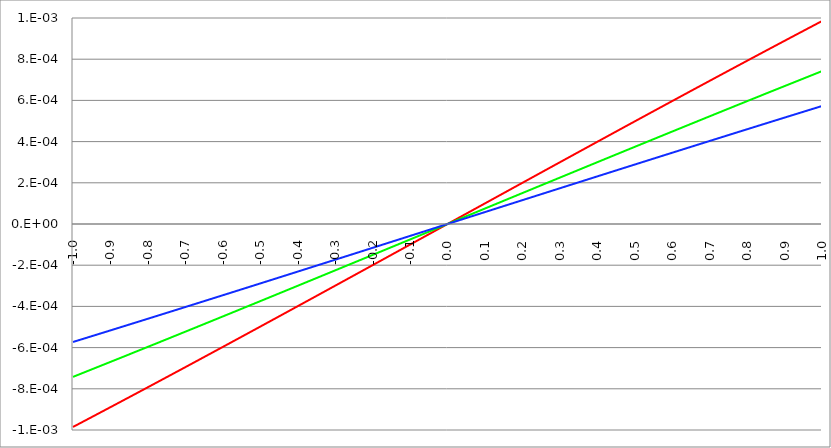
| Category | Series 1 | Series 0 | Series 2 |
|---|---|---|---|
| -1.0 | -0.001 | -0.001 | -0.001 |
| -0.999 | -0.001 | -0.001 | -0.001 |
| -0.998 | -0.001 | -0.001 | -0.001 |
| -0.997 | -0.001 | -0.001 | -0.001 |
| -0.996 | -0.001 | -0.001 | -0.001 |
| -0.995 | -0.001 | -0.001 | -0.001 |
| -0.994 | -0.001 | -0.001 | -0.001 |
| -0.993 | -0.001 | -0.001 | -0.001 |
| -0.992 | -0.001 | -0.001 | -0.001 |
| -0.991 | -0.001 | -0.001 | -0.001 |
| -0.99 | -0.001 | -0.001 | -0.001 |
| -0.989 | -0.001 | -0.001 | -0.001 |
| -0.988 | -0.001 | -0.001 | -0.001 |
| -0.987 | -0.001 | -0.001 | -0.001 |
| -0.986 | -0.001 | -0.001 | -0.001 |
| -0.985 | -0.001 | -0.001 | -0.001 |
| -0.984 | -0.001 | -0.001 | -0.001 |
| -0.983 | -0.001 | -0.001 | -0.001 |
| -0.982 | -0.001 | -0.001 | -0.001 |
| -0.981 | -0.001 | -0.001 | -0.001 |
| -0.98 | -0.001 | -0.001 | -0.001 |
| -0.979 | -0.001 | -0.001 | -0.001 |
| -0.978 | -0.001 | -0.001 | -0.001 |
| -0.977 | -0.001 | -0.001 | -0.001 |
| -0.976 | -0.001 | -0.001 | -0.001 |
| -0.975 | -0.001 | -0.001 | -0.001 |
| -0.974 | -0.001 | -0.001 | -0.001 |
| -0.973 | -0.001 | -0.001 | -0.001 |
| -0.972 | -0.001 | -0.001 | -0.001 |
| -0.971 | -0.001 | -0.001 | -0.001 |
| -0.97 | -0.001 | -0.001 | -0.001 |
| -0.969 | -0.001 | -0.001 | -0.001 |
| -0.968 | -0.001 | -0.001 | -0.001 |
| -0.967 | -0.001 | -0.001 | -0.001 |
| -0.966 | -0.001 | -0.001 | -0.001 |
| -0.965 | -0.001 | -0.001 | -0.001 |
| -0.964 | -0.001 | -0.001 | -0.001 |
| -0.963 | -0.001 | -0.001 | -0.001 |
| -0.962 | -0.001 | -0.001 | -0.001 |
| -0.961 | -0.001 | -0.001 | -0.001 |
| -0.96 | -0.001 | -0.001 | -0.001 |
| -0.959 | -0.001 | -0.001 | -0.001 |
| -0.958 | -0.001 | -0.001 | -0.001 |
| -0.957 | -0.001 | -0.001 | -0.001 |
| -0.956 | -0.001 | -0.001 | -0.001 |
| -0.955 | -0.001 | -0.001 | -0.001 |
| -0.954 | -0.001 | -0.001 | -0.001 |
| -0.953 | -0.001 | -0.001 | -0.001 |
| -0.952 | -0.001 | -0.001 | -0.001 |
| -0.951 | -0.001 | -0.001 | -0.001 |
| -0.95 | -0.001 | -0.001 | -0.001 |
| -0.949 | -0.001 | -0.001 | -0.001 |
| -0.948 | -0.001 | -0.001 | -0.001 |
| -0.947 | -0.001 | -0.001 | -0.001 |
| -0.946 | -0.001 | -0.001 | -0.001 |
| -0.945 | -0.001 | -0.001 | -0.001 |
| -0.944 | -0.001 | -0.001 | -0.001 |
| -0.943 | -0.001 | -0.001 | -0.001 |
| -0.942 | -0.001 | -0.001 | -0.001 |
| -0.941 | -0.001 | -0.001 | -0.001 |
| -0.94 | -0.001 | -0.001 | -0.001 |
| -0.939 | -0.001 | -0.001 | -0.001 |
| -0.938 | -0.001 | -0.001 | -0.001 |
| -0.937 | -0.001 | -0.001 | -0.001 |
| -0.936 | -0.001 | -0.001 | -0.001 |
| -0.935 | -0.001 | -0.001 | -0.001 |
| -0.934 | -0.001 | -0.001 | -0.001 |
| -0.933 | -0.001 | -0.001 | -0.001 |
| -0.932 | -0.001 | -0.001 | -0.001 |
| -0.931 | -0.001 | -0.001 | -0.001 |
| -0.93 | -0.001 | -0.001 | -0.001 |
| -0.929 | -0.001 | -0.001 | -0.001 |
| -0.928 | -0.001 | -0.001 | -0.001 |
| -0.927 | -0.001 | -0.001 | -0.001 |
| -0.926 | -0.001 | -0.001 | -0.001 |
| -0.925 | -0.001 | -0.001 | -0.001 |
| -0.924 | -0.001 | -0.001 | -0.001 |
| -0.923 | -0.001 | -0.001 | -0.001 |
| -0.922 | -0.001 | -0.001 | -0.001 |
| -0.921 | -0.001 | -0.001 | -0.001 |
| -0.92 | -0.001 | -0.001 | -0.001 |
| -0.919 | -0.001 | -0.001 | -0.001 |
| -0.918 | -0.001 | -0.001 | -0.001 |
| -0.917 | -0.001 | -0.001 | -0.001 |
| -0.916 | -0.001 | -0.001 | -0.001 |
| -0.915 | -0.001 | -0.001 | -0.001 |
| -0.914 | -0.001 | -0.001 | -0.001 |
| -0.913 | -0.001 | -0.001 | -0.001 |
| -0.912 | -0.001 | -0.001 | -0.001 |
| -0.911 | -0.001 | -0.001 | -0.001 |
| -0.91 | -0.001 | -0.001 | -0.001 |
| -0.909 | -0.001 | -0.001 | -0.001 |
| -0.908 | -0.001 | -0.001 | -0.001 |
| -0.907 | -0.001 | -0.001 | -0.001 |
| -0.906 | -0.001 | -0.001 | -0.001 |
| -0.905 | -0.001 | -0.001 | -0.001 |
| -0.904 | -0.001 | -0.001 | -0.001 |
| -0.903 | -0.001 | -0.001 | -0.001 |
| -0.902 | -0.001 | -0.001 | -0.001 |
| -0.901 | -0.001 | -0.001 | -0.001 |
| -0.9 | -0.001 | -0.001 | -0.001 |
| -0.899 | -0.001 | -0.001 | -0.001 |
| -0.898 | -0.001 | -0.001 | -0.001 |
| -0.897 | -0.001 | -0.001 | -0.001 |
| -0.896 | -0.001 | -0.001 | -0.001 |
| -0.895 | -0.001 | -0.001 | -0.001 |
| -0.894 | -0.001 | -0.001 | -0.001 |
| -0.893 | -0.001 | -0.001 | -0.001 |
| -0.892 | -0.001 | -0.001 | -0.001 |
| -0.891 | -0.001 | -0.001 | -0.001 |
| -0.89 | -0.001 | -0.001 | -0.001 |
| -0.889 | -0.001 | -0.001 | -0.001 |
| -0.888 | -0.001 | -0.001 | -0.001 |
| -0.887 | -0.001 | -0.001 | -0.001 |
| -0.886 | -0.001 | -0.001 | -0.001 |
| -0.885 | -0.001 | -0.001 | -0.001 |
| -0.884 | -0.001 | -0.001 | -0.001 |
| -0.883 | -0.001 | -0.001 | -0.001 |
| -0.882 | -0.001 | -0.001 | -0.001 |
| -0.881 | -0.001 | -0.001 | -0.001 |
| -0.88 | -0.001 | -0.001 | -0.001 |
| -0.879 | -0.001 | -0.001 | -0.001 |
| -0.878 | -0.001 | -0.001 | -0.001 |
| -0.877 | -0.001 | -0.001 | -0.001 |
| -0.876 | -0.001 | -0.001 | -0.001 |
| -0.875 | -0.001 | -0.001 | -0.001 |
| -0.874 | -0.001 | -0.001 | -0.001 |
| -0.873 | -0.001 | -0.001 | -0.001 |
| -0.872 | -0.001 | -0.001 | -0.001 |
| -0.871 | -0.001 | -0.001 | -0.001 |
| -0.87 | -0.001 | -0.001 | 0 |
| -0.869 | -0.001 | -0.001 | 0 |
| -0.868 | -0.001 | -0.001 | 0 |
| -0.867 | -0.001 | -0.001 | 0 |
| -0.866 | -0.001 | -0.001 | 0 |
| -0.865 | -0.001 | -0.001 | 0 |
| -0.864 | -0.001 | -0.001 | 0 |
| -0.863 | -0.001 | -0.001 | 0 |
| -0.862 | -0.001 | -0.001 | 0 |
| -0.861 | -0.001 | -0.001 | 0 |
| -0.86 | -0.001 | -0.001 | 0 |
| -0.859 | -0.001 | -0.001 | 0 |
| -0.858 | -0.001 | -0.001 | 0 |
| -0.857 | -0.001 | -0.001 | 0 |
| -0.856 | -0.001 | -0.001 | 0 |
| -0.855 | -0.001 | -0.001 | 0 |
| -0.854 | -0.001 | -0.001 | 0 |
| -0.853 | -0.001 | -0.001 | 0 |
| -0.852 | -0.001 | -0.001 | 0 |
| -0.851 | -0.001 | -0.001 | 0 |
| -0.85 | -0.001 | -0.001 | 0 |
| -0.849 | -0.001 | -0.001 | 0 |
| -0.848 | -0.001 | -0.001 | 0 |
| -0.847 | -0.001 | -0.001 | 0 |
| -0.846 | -0.001 | -0.001 | 0 |
| -0.845 | -0.001 | -0.001 | 0 |
| -0.844 | -0.001 | -0.001 | 0 |
| -0.843 | -0.001 | -0.001 | 0 |
| -0.842 | -0.001 | -0.001 | 0 |
| -0.841 | -0.001 | -0.001 | 0 |
| -0.84 | -0.001 | -0.001 | 0 |
| -0.839 | -0.001 | -0.001 | 0 |
| -0.838 | -0.001 | -0.001 | 0 |
| -0.837 | -0.001 | -0.001 | 0 |
| -0.836 | -0.001 | -0.001 | 0 |
| -0.835 | -0.001 | -0.001 | 0 |
| -0.834 | -0.001 | -0.001 | 0 |
| -0.833 | -0.001 | -0.001 | 0 |
| -0.832 | -0.001 | -0.001 | 0 |
| -0.831 | -0.001 | -0.001 | 0 |
| -0.83 | -0.001 | -0.001 | 0 |
| -0.829 | -0.001 | -0.001 | 0 |
| -0.828 | -0.001 | -0.001 | 0 |
| -0.827 | -0.001 | -0.001 | 0 |
| -0.826 | -0.001 | -0.001 | 0 |
| -0.825 | -0.001 | -0.001 | 0 |
| -0.824 | -0.001 | -0.001 | 0 |
| -0.823 | -0.001 | -0.001 | 0 |
| -0.822 | -0.001 | -0.001 | 0 |
| -0.821 | -0.001 | -0.001 | 0 |
| -0.82 | -0.001 | -0.001 | 0 |
| -0.819 | -0.001 | -0.001 | 0 |
| -0.818 | -0.001 | -0.001 | 0 |
| -0.817 | -0.001 | -0.001 | 0 |
| -0.816 | -0.001 | -0.001 | 0 |
| -0.815 | -0.001 | -0.001 | 0 |
| -0.814 | -0.001 | -0.001 | 0 |
| -0.813 | -0.001 | -0.001 | 0 |
| -0.812 | -0.001 | -0.001 | 0 |
| -0.811 | -0.001 | -0.001 | 0 |
| -0.81 | -0.001 | -0.001 | 0 |
| -0.809 | -0.001 | -0.001 | 0 |
| -0.808 | -0.001 | -0.001 | 0 |
| -0.807 | -0.001 | -0.001 | 0 |
| -0.806 | -0.001 | -0.001 | 0 |
| -0.805 | -0.001 | -0.001 | 0 |
| -0.804 | -0.001 | -0.001 | 0 |
| -0.803 | -0.001 | -0.001 | 0 |
| -0.802 | -0.001 | -0.001 | 0 |
| -0.801 | -0.001 | -0.001 | 0 |
| -0.8 | -0.001 | -0.001 | 0 |
| -0.799 | -0.001 | -0.001 | 0 |
| -0.798 | -0.001 | -0.001 | 0 |
| -0.797 | -0.001 | -0.001 | 0 |
| -0.796 | -0.001 | -0.001 | 0 |
| -0.795 | -0.001 | -0.001 | 0 |
| -0.794 | -0.001 | -0.001 | 0 |
| -0.793 | -0.001 | -0.001 | 0 |
| -0.792 | -0.001 | -0.001 | 0 |
| -0.791 | -0.001 | -0.001 | 0 |
| -0.79 | -0.001 | -0.001 | 0 |
| -0.789 | -0.001 | -0.001 | 0 |
| -0.788 | -0.001 | -0.001 | 0 |
| -0.787 | -0.001 | -0.001 | 0 |
| -0.786 | -0.001 | -0.001 | 0 |
| -0.785 | -0.001 | -0.001 | 0 |
| -0.784 | -0.001 | -0.001 | 0 |
| -0.783 | -0.001 | -0.001 | 0 |
| -0.782 | -0.001 | -0.001 | 0 |
| -0.781 | -0.001 | -0.001 | 0 |
| -0.78 | -0.001 | -0.001 | 0 |
| -0.779 | -0.001 | -0.001 | 0 |
| -0.778 | -0.001 | -0.001 | 0 |
| -0.777 | -0.001 | -0.001 | 0 |
| -0.776 | -0.001 | -0.001 | 0 |
| -0.775 | -0.001 | -0.001 | 0 |
| -0.774 | -0.001 | -0.001 | 0 |
| -0.773 | -0.001 | -0.001 | 0 |
| -0.772 | -0.001 | -0.001 | 0 |
| -0.771 | -0.001 | -0.001 | 0 |
| -0.77 | -0.001 | -0.001 | 0 |
| -0.769 | -0.001 | -0.001 | 0 |
| -0.768 | -0.001 | -0.001 | 0 |
| -0.767 | -0.001 | -0.001 | 0 |
| -0.766 | -0.001 | -0.001 | 0 |
| -0.765 | -0.001 | -0.001 | 0 |
| -0.764 | -0.001 | -0.001 | 0 |
| -0.763 | -0.001 | -0.001 | 0 |
| -0.762 | -0.001 | -0.001 | 0 |
| -0.761 | -0.001 | -0.001 | 0 |
| -0.76 | -0.001 | -0.001 | 0 |
| -0.759 | -0.001 | -0.001 | 0 |
| -0.758 | -0.001 | -0.001 | 0 |
| -0.757 | -0.001 | -0.001 | 0 |
| -0.756 | -0.001 | -0.001 | 0 |
| -0.755 | -0.001 | -0.001 | 0 |
| -0.754 | -0.001 | -0.001 | 0 |
| -0.753 | -0.001 | -0.001 | 0 |
| -0.752 | -0.001 | -0.001 | 0 |
| -0.751 | -0.001 | -0.001 | 0 |
| -0.75 | -0.001 | -0.001 | 0 |
| -0.749 | -0.001 | -0.001 | 0 |
| -0.748 | -0.001 | -0.001 | 0 |
| -0.747 | -0.001 | -0.001 | 0 |
| -0.746 | -0.001 | -0.001 | 0 |
| -0.745 | -0.001 | -0.001 | 0 |
| -0.744 | -0.001 | -0.001 | 0 |
| -0.743 | -0.001 | -0.001 | 0 |
| -0.742 | -0.001 | -0.001 | 0 |
| -0.741 | -0.001 | -0.001 | 0 |
| -0.74 | -0.001 | -0.001 | 0 |
| -0.739 | -0.001 | -0.001 | 0 |
| -0.738 | -0.001 | -0.001 | 0 |
| -0.737 | -0.001 | -0.001 | 0 |
| -0.736 | -0.001 | -0.001 | 0 |
| -0.735 | -0.001 | -0.001 | 0 |
| -0.734 | -0.001 | -0.001 | 0 |
| -0.733 | -0.001 | -0.001 | 0 |
| -0.732 | -0.001 | -0.001 | 0 |
| -0.731 | -0.001 | -0.001 | 0 |
| -0.73 | -0.001 | -0.001 | 0 |
| -0.729 | -0.001 | -0.001 | 0 |
| -0.728 | -0.001 | -0.001 | 0 |
| -0.727 | -0.001 | -0.001 | 0 |
| -0.726 | -0.001 | -0.001 | 0 |
| -0.725 | -0.001 | -0.001 | 0 |
| -0.724 | -0.001 | -0.001 | 0 |
| -0.723 | -0.001 | -0.001 | 0 |
| -0.722 | -0.001 | -0.001 | 0 |
| -0.721 | -0.001 | -0.001 | 0 |
| -0.72 | -0.001 | -0.001 | 0 |
| -0.719 | -0.001 | -0.001 | 0 |
| -0.718 | -0.001 | -0.001 | 0 |
| -0.717 | -0.001 | -0.001 | 0 |
| -0.716 | -0.001 | -0.001 | 0 |
| -0.715 | -0.001 | -0.001 | 0 |
| -0.714 | -0.001 | -0.001 | 0 |
| -0.713 | -0.001 | -0.001 | 0 |
| -0.712 | -0.001 | -0.001 | 0 |
| -0.711 | -0.001 | -0.001 | 0 |
| -0.71 | -0.001 | -0.001 | 0 |
| -0.709 | -0.001 | -0.001 | 0 |
| -0.708 | -0.001 | -0.001 | 0 |
| -0.707 | -0.001 | -0.001 | 0 |
| -0.706 | -0.001 | -0.001 | 0 |
| -0.705 | -0.001 | -0.001 | 0 |
| -0.704 | -0.001 | -0.001 | 0 |
| -0.703 | -0.001 | -0.001 | 0 |
| -0.702 | -0.001 | -0.001 | 0 |
| -0.701 | -0.001 | -0.001 | 0 |
| -0.7 | -0.001 | -0.001 | 0 |
| -0.699 | -0.001 | -0.001 | 0 |
| -0.698 | -0.001 | -0.001 | 0 |
| -0.697 | -0.001 | -0.001 | 0 |
| -0.696 | -0.001 | -0.001 | 0 |
| -0.695 | -0.001 | -0.001 | 0 |
| -0.694 | -0.001 | -0.001 | 0 |
| -0.693 | -0.001 | -0.001 | 0 |
| -0.692 | -0.001 | -0.001 | 0 |
| -0.691 | -0.001 | -0.001 | 0 |
| -0.69 | -0.001 | -0.001 | 0 |
| -0.689 | -0.001 | -0.001 | 0 |
| -0.688 | -0.001 | -0.001 | 0 |
| -0.687 | -0.001 | -0.001 | 0 |
| -0.686 | -0.001 | -0.001 | 0 |
| -0.685 | -0.001 | -0.001 | 0 |
| -0.684 | -0.001 | -0.001 | 0 |
| -0.683 | -0.001 | -0.001 | 0 |
| -0.682 | -0.001 | -0.001 | 0 |
| -0.681 | -0.001 | -0.001 | 0 |
| -0.68 | -0.001 | -0.001 | 0 |
| -0.679 | -0.001 | -0.001 | 0 |
| -0.678 | -0.001 | -0.001 | 0 |
| -0.677 | -0.001 | -0.001 | 0 |
| -0.676 | -0.001 | -0.001 | 0 |
| -0.675 | -0.001 | -0.001 | 0 |
| -0.674 | -0.001 | -0.001 | 0 |
| -0.673 | -0.001 | -0.001 | 0 |
| -0.672 | -0.001 | -0.001 | 0 |
| -0.671 | -0.001 | -0.001 | 0 |
| -0.67 | -0.001 | -0.001 | 0 |
| -0.669 | -0.001 | 0 | 0 |
| -0.668 | -0.001 | 0 | 0 |
| -0.667 | -0.001 | 0 | 0 |
| -0.666 | -0.001 | 0 | 0 |
| -0.665 | -0.001 | 0 | 0 |
| -0.664 | -0.001 | 0 | 0 |
| -0.663 | -0.001 | 0 | 0 |
| -0.662 | -0.001 | 0 | 0 |
| -0.661 | -0.001 | 0 | 0 |
| -0.66 | -0.001 | 0 | 0 |
| -0.659 | -0.001 | 0 | 0 |
| -0.658 | -0.001 | 0 | 0 |
| -0.657 | -0.001 | 0 | 0 |
| -0.656 | -0.001 | 0 | 0 |
| -0.655 | -0.001 | 0 | 0 |
| -0.654 | -0.001 | 0 | 0 |
| -0.653 | -0.001 | 0 | 0 |
| -0.652 | -0.001 | 0 | 0 |
| -0.651 | -0.001 | 0 | 0 |
| -0.65 | -0.001 | 0 | 0 |
| -0.649 | -0.001 | 0 | 0 |
| -0.648 | -0.001 | 0 | 0 |
| -0.647 | -0.001 | 0 | 0 |
| -0.646 | -0.001 | 0 | 0 |
| -0.645 | -0.001 | 0 | 0 |
| -0.644 | -0.001 | 0 | 0 |
| -0.643 | -0.001 | 0 | 0 |
| -0.642 | -0.001 | 0 | 0 |
| -0.641 | -0.001 | 0 | 0 |
| -0.64 | -0.001 | 0 | 0 |
| -0.639 | -0.001 | 0 | 0 |
| -0.638 | -0.001 | 0 | 0 |
| -0.637 | -0.001 | 0 | 0 |
| -0.636 | -0.001 | 0 | 0 |
| -0.635 | -0.001 | 0 | 0 |
| -0.634 | -0.001 | 0 | 0 |
| -0.633 | -0.001 | 0 | 0 |
| -0.632 | -0.001 | 0 | 0 |
| -0.631 | -0.001 | 0 | 0 |
| -0.63 | -0.001 | 0 | 0 |
| -0.629 | -0.001 | 0 | 0 |
| -0.628 | -0.001 | 0 | 0 |
| -0.627 | -0.001 | 0 | 0 |
| -0.626 | -0.001 | 0 | 0 |
| -0.625 | -0.001 | 0 | 0 |
| -0.624 | -0.001 | 0 | 0 |
| -0.623 | -0.001 | 0 | 0 |
| -0.622 | -0.001 | 0 | 0 |
| -0.621 | -0.001 | 0 | 0 |
| -0.62 | -0.001 | 0 | 0 |
| -0.619 | -0.001 | 0 | 0 |
| -0.618 | -0.001 | 0 | 0 |
| -0.617 | -0.001 | 0 | 0 |
| -0.616 | -0.001 | 0 | 0 |
| -0.615 | -0.001 | 0 | 0 |
| -0.614 | -0.001 | 0 | 0 |
| -0.613 | -0.001 | 0 | 0 |
| -0.612 | -0.001 | 0 | 0 |
| -0.611 | -0.001 | 0 | 0 |
| -0.61 | -0.001 | 0 | 0 |
| -0.609 | -0.001 | 0 | 0 |
| -0.608 | -0.001 | 0 | 0 |
| -0.607 | -0.001 | 0 | 0 |
| -0.606 | -0.001 | 0 | 0 |
| -0.605 | -0.001 | 0 | 0 |
| -0.604 | -0.001 | 0 | 0 |
| -0.603 | -0.001 | 0 | 0 |
| -0.602 | -0.001 | 0 | 0 |
| -0.601 | -0.001 | 0 | 0 |
| -0.6 | -0.001 | 0 | 0 |
| -0.599 | -0.001 | 0 | 0 |
| -0.598 | -0.001 | 0 | 0 |
| -0.597 | -0.001 | 0 | 0 |
| -0.596 | -0.001 | 0 | 0 |
| -0.595 | -0.001 | 0 | 0 |
| -0.594 | -0.001 | 0 | 0 |
| -0.593 | -0.001 | 0 | 0 |
| -0.592 | -0.001 | 0 | 0 |
| -0.591 | -0.001 | 0 | 0 |
| -0.59 | -0.001 | 0 | 0 |
| -0.589 | -0.001 | 0 | 0 |
| -0.588 | -0.001 | 0 | 0 |
| -0.587 | -0.001 | 0 | 0 |
| -0.586 | -0.001 | 0 | 0 |
| -0.585 | -0.001 | 0 | 0 |
| -0.584 | -0.001 | 0 | 0 |
| -0.583 | -0.001 | 0 | 0 |
| -0.582 | -0.001 | 0 | 0 |
| -0.581 | -0.001 | 0 | 0 |
| -0.58 | -0.001 | 0 | 0 |
| -0.579 | -0.001 | 0 | 0 |
| -0.578 | -0.001 | 0 | 0 |
| -0.577 | -0.001 | 0 | 0 |
| -0.576 | -0.001 | 0 | 0 |
| -0.575 | -0.001 | 0 | 0 |
| -0.574 | -0.001 | 0 | 0 |
| -0.573 | -0.001 | 0 | 0 |
| -0.572 | -0.001 | 0 | 0 |
| -0.571 | -0.001 | 0 | 0 |
| -0.57 | -0.001 | 0 | 0 |
| -0.569 | -0.001 | 0 | 0 |
| -0.568 | -0.001 | 0 | 0 |
| -0.567 | -0.001 | 0 | 0 |
| -0.566 | -0.001 | 0 | 0 |
| -0.565 | -0.001 | 0 | 0 |
| -0.564 | -0.001 | 0 | 0 |
| -0.563 | -0.001 | 0 | 0 |
| -0.562 | -0.001 | 0 | 0 |
| -0.561 | -0.001 | 0 | 0 |
| -0.56 | -0.001 | 0 | 0 |
| -0.559 | -0.001 | 0 | 0 |
| -0.558 | -0.001 | 0 | 0 |
| -0.557 | -0.001 | 0 | 0 |
| -0.556 | -0.001 | 0 | 0 |
| -0.555 | -0.001 | 0 | 0 |
| -0.554 | -0.001 | 0 | 0 |
| -0.553 | -0.001 | 0 | 0 |
| -0.552 | -0.001 | 0 | 0 |
| -0.551 | -0.001 | 0 | 0 |
| -0.55 | -0.001 | 0 | 0 |
| -0.549 | -0.001 | 0 | 0 |
| -0.548 | -0.001 | 0 | 0 |
| -0.547 | -0.001 | 0 | 0 |
| -0.546 | -0.001 | 0 | 0 |
| -0.545 | -0.001 | 0 | 0 |
| -0.544 | -0.001 | 0 | 0 |
| -0.543 | -0.001 | 0 | 0 |
| -0.542 | -0.001 | 0 | 0 |
| -0.541 | -0.001 | 0 | 0 |
| -0.54 | -0.001 | 0 | 0 |
| -0.539 | -0.001 | 0 | 0 |
| -0.538 | -0.001 | 0 | 0 |
| -0.537 | -0.001 | 0 | 0 |
| -0.536 | -0.001 | 0 | 0 |
| -0.535 | -0.001 | 0 | 0 |
| -0.534 | -0.001 | 0 | 0 |
| -0.533 | -0.001 | 0 | 0 |
| -0.532 | -0.001 | 0 | 0 |
| -0.531 | -0.001 | 0 | 0 |
| -0.53 | -0.001 | 0 | 0 |
| -0.529 | -0.001 | 0 | 0 |
| -0.528 | -0.001 | 0 | 0 |
| -0.527 | -0.001 | 0 | 0 |
| -0.526 | -0.001 | 0 | 0 |
| -0.525 | -0.001 | 0 | 0 |
| -0.524 | -0.001 | 0 | 0 |
| -0.523 | -0.001 | 0 | 0 |
| -0.522 | -0.001 | 0 | 0 |
| -0.521 | -0.001 | 0 | 0 |
| -0.52 | -0.001 | 0 | 0 |
| -0.519 | -0.001 | 0 | 0 |
| -0.518 | -0.001 | 0 | 0 |
| -0.517 | -0.001 | 0 | 0 |
| -0.516 | -0.001 | 0 | 0 |
| -0.515 | -0.001 | 0 | 0 |
| -0.514 | -0.001 | 0 | 0 |
| -0.513 | -0.001 | 0 | 0 |
| -0.512 | -0.001 | 0 | 0 |
| -0.511 | -0.001 | 0 | 0 |
| -0.51 | -0.001 | 0 | 0 |
| -0.509 | -0.001 | 0 | 0 |
| -0.508 | -0.001 | 0 | 0 |
| -0.507 | -0.001 | 0 | 0 |
| -0.506 | -0.001 | 0 | 0 |
| -0.505 | -0.001 | 0 | 0 |
| -0.504 | -0.001 | 0 | 0 |
| -0.503 | -0.001 | 0 | 0 |
| -0.502 | -0.001 | 0 | 0 |
| -0.501 | 0 | 0 | 0 |
| -0.5 | 0 | 0 | 0 |
| -0.499 | 0 | 0 | 0 |
| -0.498 | 0 | 0 | 0 |
| -0.497 | 0 | 0 | 0 |
| -0.496 | 0 | 0 | 0 |
| -0.495 | 0 | 0 | 0 |
| -0.494 | 0 | 0 | 0 |
| -0.493 | 0 | 0 | 0 |
| -0.492 | 0 | 0 | 0 |
| -0.491 | 0 | 0 | 0 |
| -0.49 | 0 | 0 | 0 |
| -0.489 | 0 | 0 | 0 |
| -0.488 | 0 | 0 | 0 |
| -0.487 | 0 | 0 | 0 |
| -0.486 | 0 | 0 | 0 |
| -0.485 | 0 | 0 | 0 |
| -0.484 | 0 | 0 | 0 |
| -0.483 | 0 | 0 | 0 |
| -0.482 | 0 | 0 | 0 |
| -0.481 | 0 | 0 | 0 |
| -0.48 | 0 | 0 | 0 |
| -0.479 | 0 | 0 | 0 |
| -0.478 | 0 | 0 | 0 |
| -0.477 | 0 | 0 | 0 |
| -0.476 | 0 | 0 | 0 |
| -0.475 | 0 | 0 | 0 |
| -0.474 | 0 | 0 | 0 |
| -0.473 | 0 | 0 | 0 |
| -0.472 | 0 | 0 | 0 |
| -0.471 | 0 | 0 | 0 |
| -0.469999999999999 | 0 | 0 | 0 |
| -0.468999999999999 | 0 | 0 | 0 |
| -0.467999999999999 | 0 | 0 | 0 |
| -0.466999999999999 | 0 | 0 | 0 |
| -0.465999999999999 | 0 | 0 | 0 |
| -0.464999999999999 | 0 | 0 | 0 |
| -0.463999999999999 | 0 | 0 | 0 |
| -0.462999999999999 | 0 | 0 | 0 |
| -0.461999999999999 | 0 | 0 | 0 |
| -0.460999999999999 | 0 | 0 | 0 |
| -0.459999999999999 | 0 | 0 | 0 |
| -0.458999999999999 | 0 | 0 | 0 |
| -0.457999999999999 | 0 | 0 | 0 |
| -0.456999999999999 | 0 | 0 | 0 |
| -0.455999999999999 | 0 | 0 | 0 |
| -0.454999999999999 | 0 | 0 | 0 |
| -0.453999999999999 | 0 | 0 | 0 |
| -0.452999999999999 | 0 | 0 | 0 |
| -0.451999999999999 | 0 | 0 | 0 |
| -0.450999999999999 | 0 | 0 | 0 |
| -0.449999999999999 | 0 | 0 | 0 |
| -0.448999999999999 | 0 | 0 | 0 |
| -0.447999999999999 | 0 | 0 | 0 |
| -0.446999999999999 | 0 | 0 | 0 |
| -0.445999999999999 | 0 | 0 | 0 |
| -0.444999999999999 | 0 | 0 | 0 |
| -0.443999999999999 | 0 | 0 | 0 |
| -0.442999999999999 | 0 | 0 | 0 |
| -0.441999999999999 | 0 | 0 | 0 |
| -0.440999999999999 | 0 | 0 | 0 |
| -0.439999999999999 | 0 | 0 | 0 |
| -0.438999999999999 | 0 | 0 | 0 |
| -0.437999999999999 | 0 | 0 | 0 |
| -0.436999999999999 | 0 | 0 | 0 |
| -0.435999999999999 | 0 | 0 | 0 |
| -0.434999999999999 | 0 | 0 | 0 |
| -0.433999999999999 | 0 | 0 | 0 |
| -0.432999999999999 | 0 | 0 | 0 |
| -0.431999999999999 | 0 | 0 | 0 |
| -0.430999999999999 | 0 | 0 | 0 |
| -0.429999999999999 | 0 | 0 | 0 |
| -0.428999999999999 | 0 | 0 | 0 |
| -0.427999999999999 | 0 | 0 | 0 |
| -0.426999999999999 | 0 | 0 | 0 |
| -0.425999999999999 | 0 | 0 | 0 |
| -0.424999999999999 | 0 | 0 | 0 |
| -0.423999999999999 | 0 | 0 | 0 |
| -0.422999999999999 | 0 | 0 | 0 |
| -0.421999999999999 | 0 | 0 | 0 |
| -0.420999999999999 | 0 | 0 | 0 |
| -0.419999999999999 | 0 | 0 | 0 |
| -0.418999999999999 | 0 | 0 | 0 |
| -0.417999999999999 | 0 | 0 | 0 |
| -0.416999999999999 | 0 | 0 | 0 |
| -0.415999999999999 | 0 | 0 | 0 |
| -0.414999999999999 | 0 | 0 | 0 |
| -0.413999999999999 | 0 | 0 | 0 |
| -0.412999999999999 | 0 | 0 | 0 |
| -0.411999999999999 | 0 | 0 | 0 |
| -0.410999999999999 | 0 | 0 | 0 |
| -0.409999999999999 | 0 | 0 | 0 |
| -0.408999999999999 | 0 | 0 | 0 |
| -0.407999999999999 | 0 | 0 | 0 |
| -0.406999999999999 | 0 | 0 | 0 |
| -0.405999999999999 | 0 | 0 | 0 |
| -0.404999999999999 | 0 | 0 | 0 |
| -0.403999999999999 | 0 | 0 | 0 |
| -0.402999999999999 | 0 | 0 | 0 |
| -0.401999999999999 | 0 | 0 | 0 |
| -0.400999999999999 | 0 | 0 | 0 |
| -0.399999999999999 | 0 | 0 | 0 |
| -0.398999999999999 | 0 | 0 | 0 |
| -0.397999999999999 | 0 | 0 | 0 |
| -0.396999999999999 | 0 | 0 | 0 |
| -0.395999999999999 | 0 | 0 | 0 |
| -0.394999999999999 | 0 | 0 | 0 |
| -0.393999999999999 | 0 | 0 | 0 |
| -0.392999999999999 | 0 | 0 | 0 |
| -0.391999999999999 | 0 | 0 | 0 |
| -0.390999999999999 | 0 | 0 | 0 |
| -0.389999999999999 | 0 | 0 | 0 |
| -0.388999999999999 | 0 | 0 | 0 |
| -0.387999999999999 | 0 | 0 | 0 |
| -0.386999999999999 | 0 | 0 | 0 |
| -0.385999999999999 | 0 | 0 | 0 |
| -0.384999999999999 | 0 | 0 | 0 |
| -0.383999999999999 | 0 | 0 | 0 |
| -0.382999999999999 | 0 | 0 | 0 |
| -0.381999999999999 | 0 | 0 | 0 |
| -0.380999999999999 | 0 | 0 | 0 |
| -0.379999999999999 | 0 | 0 | 0 |
| -0.378999999999999 | 0 | 0 | 0 |
| -0.377999999999999 | 0 | 0 | 0 |
| -0.376999999999999 | 0 | 0 | 0 |
| -0.375999999999999 | 0 | 0 | 0 |
| -0.374999999999999 | 0 | 0 | 0 |
| -0.373999999999999 | 0 | 0 | 0 |
| -0.372999999999999 | 0 | 0 | 0 |
| -0.371999999999999 | 0 | 0 | 0 |
| -0.370999999999999 | 0 | 0 | 0 |
| -0.369999999999999 | 0 | 0 | 0 |
| -0.368999999999999 | 0 | 0 | 0 |
| -0.367999999999999 | 0 | 0 | 0 |
| -0.366999999999999 | 0 | 0 | 0 |
| -0.365999999999999 | 0 | 0 | 0 |
| -0.364999999999999 | 0 | 0 | 0 |
| -0.363999999999999 | 0 | 0 | 0 |
| -0.362999999999999 | 0 | 0 | 0 |
| -0.361999999999999 | 0 | 0 | 0 |
| -0.360999999999999 | 0 | 0 | 0 |
| -0.359999999999999 | 0 | 0 | 0 |
| -0.358999999999999 | 0 | 0 | 0 |
| -0.357999999999999 | 0 | 0 | 0 |
| -0.356999999999999 | 0 | 0 | 0 |
| -0.355999999999999 | 0 | 0 | 0 |
| -0.354999999999999 | 0 | 0 | 0 |
| -0.353999999999999 | 0 | 0 | 0 |
| -0.352999999999999 | 0 | 0 | 0 |
| -0.351999999999999 | 0 | 0 | 0 |
| -0.350999999999999 | 0 | 0 | 0 |
| -0.349999999999999 | 0 | 0 | 0 |
| -0.348999999999999 | 0 | 0 | 0 |
| -0.347999999999999 | 0 | 0 | 0 |
| -0.346999999999999 | 0 | 0 | 0 |
| -0.345999999999999 | 0 | 0 | 0 |
| -0.344999999999999 | 0 | 0 | 0 |
| -0.343999999999999 | 0 | 0 | 0 |
| -0.342999999999999 | 0 | 0 | 0 |
| -0.341999999999999 | 0 | 0 | 0 |
| -0.340999999999999 | 0 | 0 | 0 |
| -0.339999999999999 | 0 | 0 | 0 |
| -0.338999999999999 | 0 | 0 | 0 |
| -0.337999999999999 | 0 | 0 | 0 |
| -0.336999999999999 | 0 | 0 | 0 |
| -0.335999999999999 | 0 | 0 | 0 |
| -0.334999999999999 | 0 | 0 | 0 |
| -0.333999999999999 | 0 | 0 | 0 |
| -0.332999999999999 | 0 | 0 | 0 |
| -0.331999999999999 | 0 | 0 | 0 |
| -0.330999999999999 | 0 | 0 | 0 |
| -0.329999999999999 | 0 | 0 | 0 |
| -0.328999999999999 | 0 | 0 | 0 |
| -0.327999999999999 | 0 | 0 | 0 |
| -0.326999999999999 | 0 | 0 | 0 |
| -0.325999999999999 | 0 | 0 | 0 |
| -0.324999999999999 | 0 | 0 | 0 |
| -0.323999999999999 | 0 | 0 | 0 |
| -0.322999999999999 | 0 | 0 | 0 |
| -0.321999999999999 | 0 | 0 | 0 |
| -0.320999999999999 | 0 | 0 | 0 |
| -0.319999999999999 | 0 | 0 | 0 |
| -0.318999999999999 | 0 | 0 | 0 |
| -0.317999999999999 | 0 | 0 | 0 |
| -0.316999999999999 | 0 | 0 | 0 |
| -0.315999999999999 | 0 | 0 | 0 |
| -0.314999999999999 | 0 | 0 | 0 |
| -0.313999999999999 | 0 | 0 | 0 |
| -0.312999999999999 | 0 | 0 | 0 |
| -0.311999999999999 | 0 | 0 | 0 |
| -0.310999999999999 | 0 | 0 | 0 |
| -0.309999999999999 | 0 | 0 | 0 |
| -0.308999999999999 | 0 | 0 | 0 |
| -0.307999999999999 | 0 | 0 | 0 |
| -0.306999999999999 | 0 | 0 | 0 |
| -0.305999999999999 | 0 | 0 | 0 |
| -0.304999999999999 | 0 | 0 | 0 |
| -0.303999999999999 | 0 | 0 | 0 |
| -0.302999999999999 | 0 | 0 | 0 |
| -0.301999999999999 | 0 | 0 | 0 |
| -0.300999999999999 | 0 | 0 | 0 |
| -0.299999999999999 | 0 | 0 | 0 |
| -0.298999999999999 | 0 | 0 | 0 |
| -0.297999999999999 | 0 | 0 | 0 |
| -0.296999999999999 | 0 | 0 | 0 |
| -0.295999999999999 | 0 | 0 | 0 |
| -0.294999999999999 | 0 | 0 | 0 |
| -0.293999999999999 | 0 | 0 | 0 |
| -0.292999999999999 | 0 | 0 | 0 |
| -0.291999999999999 | 0 | 0 | 0 |
| -0.290999999999999 | 0 | 0 | 0 |
| -0.289999999999999 | 0 | 0 | 0 |
| -0.288999999999999 | 0 | 0 | 0 |
| -0.287999999999999 | 0 | 0 | 0 |
| -0.286999999999999 | 0 | 0 | 0 |
| -0.285999999999999 | 0 | 0 | 0 |
| -0.284999999999999 | 0 | 0 | 0 |
| -0.283999999999999 | 0 | 0 | 0 |
| -0.282999999999999 | 0 | 0 | 0 |
| -0.281999999999999 | 0 | 0 | 0 |
| -0.280999999999999 | 0 | 0 | 0 |
| -0.279999999999999 | 0 | 0 | 0 |
| -0.278999999999999 | 0 | 0 | 0 |
| -0.277999999999999 | 0 | 0 | 0 |
| -0.276999999999999 | 0 | 0 | 0 |
| -0.275999999999999 | 0 | 0 | 0 |
| -0.274999999999999 | 0 | 0 | 0 |
| -0.273999999999999 | 0 | 0 | 0 |
| -0.272999999999999 | 0 | 0 | 0 |
| -0.271999999999999 | 0 | 0 | 0 |
| -0.270999999999999 | 0 | 0 | 0 |
| -0.269999999999999 | 0 | 0 | 0 |
| -0.268999999999999 | 0 | 0 | 0 |
| -0.267999999999999 | 0 | 0 | 0 |
| -0.266999999999999 | 0 | 0 | 0 |
| -0.265999999999999 | 0 | 0 | 0 |
| -0.264999999999999 | 0 | 0 | 0 |
| -0.263999999999999 | 0 | 0 | 0 |
| -0.262999999999999 | 0 | 0 | 0 |
| -0.261999999999999 | 0 | 0 | 0 |
| -0.260999999999999 | 0 | 0 | 0 |
| -0.259999999999999 | 0 | 0 | 0 |
| -0.258999999999999 | 0 | 0 | 0 |
| -0.257999999999999 | 0 | 0 | 0 |
| -0.256999999999999 | 0 | 0 | 0 |
| -0.255999999999999 | 0 | 0 | 0 |
| -0.254999999999999 | 0 | 0 | 0 |
| -0.253999999999999 | 0 | 0 | 0 |
| -0.252999999999999 | 0 | 0 | 0 |
| -0.251999999999999 | 0 | 0 | 0 |
| -0.250999999999999 | 0 | 0 | 0 |
| -0.249999999999999 | 0 | 0 | 0 |
| -0.248999999999999 | 0 | 0 | 0 |
| -0.247999999999999 | 0 | 0 | 0 |
| -0.246999999999999 | 0 | 0 | 0 |
| -0.245999999999999 | 0 | 0 | 0 |
| -0.244999999999999 | 0 | 0 | 0 |
| -0.243999999999999 | 0 | 0 | 0 |
| -0.242999999999999 | 0 | 0 | 0 |
| -0.241999999999999 | 0 | 0 | 0 |
| -0.240999999999999 | 0 | 0 | 0 |
| -0.239999999999999 | 0 | 0 | 0 |
| -0.238999999999999 | 0 | 0 | 0 |
| -0.237999999999999 | 0 | 0 | 0 |
| -0.236999999999999 | 0 | 0 | 0 |
| -0.235999999999999 | 0 | 0 | 0 |
| -0.234999999999999 | 0 | 0 | 0 |
| -0.233999999999999 | 0 | 0 | 0 |
| -0.232999999999999 | 0 | 0 | 0 |
| -0.231999999999999 | 0 | 0 | 0 |
| -0.230999999999999 | 0 | 0 | 0 |
| -0.229999999999999 | 0 | 0 | 0 |
| -0.228999999999999 | 0 | 0 | 0 |
| -0.227999999999999 | 0 | 0 | 0 |
| -0.226999999999999 | 0 | 0 | 0 |
| -0.225999999999999 | 0 | 0 | 0 |
| -0.224999999999999 | 0 | 0 | 0 |
| -0.223999999999999 | 0 | 0 | 0 |
| -0.222999999999999 | 0 | 0 | 0 |
| -0.221999999999999 | 0 | 0 | 0 |
| -0.220999999999999 | 0 | 0 | 0 |
| -0.219999999999999 | 0 | 0 | 0 |
| -0.218999999999999 | 0 | 0 | 0 |
| -0.217999999999999 | 0 | 0 | 0 |
| -0.216999999999999 | 0 | 0 | 0 |
| -0.215999999999999 | 0 | 0 | 0 |
| -0.214999999999999 | 0 | 0 | 0 |
| -0.213999999999999 | 0 | 0 | 0 |
| -0.212999999999999 | 0 | 0 | 0 |
| -0.211999999999999 | 0 | 0 | 0 |
| -0.210999999999999 | 0 | 0 | 0 |
| -0.209999999999999 | 0 | 0 | 0 |
| -0.208999999999999 | 0 | 0 | 0 |
| -0.207999999999999 | 0 | 0 | 0 |
| -0.206999999999999 | 0 | 0 | 0 |
| -0.205999999999999 | 0 | 0 | 0 |
| -0.204999999999999 | 0 | 0 | 0 |
| -0.203999999999999 | 0 | 0 | 0 |
| -0.202999999999999 | 0 | 0 | 0 |
| -0.201999999999999 | 0 | 0 | 0 |
| -0.200999999999999 | 0 | 0 | 0 |
| -0.199999999999999 | 0 | 0 | 0 |
| -0.198999999999999 | 0 | 0 | 0 |
| -0.197999999999999 | 0 | 0 | 0 |
| -0.196999999999999 | 0 | 0 | 0 |
| -0.195999999999999 | 0 | 0 | 0 |
| -0.194999999999999 | 0 | 0 | 0 |
| -0.193999999999999 | 0 | 0 | 0 |
| -0.192999999999999 | 0 | 0 | 0 |
| -0.191999999999999 | 0 | 0 | 0 |
| -0.190999999999999 | 0 | 0 | 0 |
| -0.189999999999999 | 0 | 0 | 0 |
| -0.188999999999999 | 0 | 0 | 0 |
| -0.187999999999999 | 0 | 0 | 0 |
| -0.186999999999999 | 0 | 0 | 0 |
| -0.185999999999999 | 0 | 0 | 0 |
| -0.184999999999999 | 0 | 0 | 0 |
| -0.183999999999999 | 0 | 0 | 0 |
| -0.182999999999999 | 0 | 0 | 0 |
| -0.181999999999999 | 0 | 0 | 0 |
| -0.180999999999999 | 0 | 0 | 0 |
| -0.179999999999999 | 0 | 0 | 0 |
| -0.178999999999999 | 0 | 0 | 0 |
| -0.177999999999999 | 0 | 0 | 0 |
| -0.176999999999999 | 0 | 0 | 0 |
| -0.175999999999999 | 0 | 0 | 0 |
| -0.174999999999999 | 0 | 0 | 0 |
| -0.173999999999999 | 0 | 0 | 0 |
| -0.172999999999999 | 0 | 0 | 0 |
| -0.171999999999999 | 0 | 0 | 0 |
| -0.170999999999999 | 0 | 0 | 0 |
| -0.169999999999999 | 0 | 0 | 0 |
| -0.168999999999999 | 0 | 0 | 0 |
| -0.167999999999999 | 0 | 0 | 0 |
| -0.166999999999999 | 0 | 0 | 0 |
| -0.165999999999999 | 0 | 0 | 0 |
| -0.164999999999999 | 0 | 0 | 0 |
| -0.163999999999999 | 0 | 0 | 0 |
| -0.162999999999999 | 0 | 0 | 0 |
| -0.161999999999999 | 0 | 0 | 0 |
| -0.160999999999999 | 0 | 0 | 0 |
| -0.159999999999999 | 0 | 0 | 0 |
| -0.158999999999999 | 0 | 0 | 0 |
| -0.157999999999999 | 0 | 0 | 0 |
| -0.156999999999999 | 0 | 0 | 0 |
| -0.155999999999999 | 0 | 0 | 0 |
| -0.154999999999999 | 0 | 0 | 0 |
| -0.153999999999999 | 0 | 0 | 0 |
| -0.152999999999999 | 0 | 0 | 0 |
| -0.151999999999999 | 0 | 0 | 0 |
| -0.150999999999999 | 0 | 0 | 0 |
| -0.149999999999999 | 0 | 0 | 0 |
| -0.148999999999999 | 0 | 0 | 0 |
| -0.147999999999999 | 0 | 0 | 0 |
| -0.146999999999999 | 0 | 0 | 0 |
| -0.145999999999999 | 0 | 0 | 0 |
| -0.144999999999999 | 0 | 0 | 0 |
| -0.143999999999999 | 0 | 0 | 0 |
| -0.142999999999999 | 0 | 0 | 0 |
| -0.141999999999999 | 0 | 0 | 0 |
| -0.140999999999999 | 0 | 0 | 0 |
| -0.139999999999999 | 0 | 0 | 0 |
| -0.138999999999999 | 0 | 0 | 0 |
| -0.137999999999999 | 0 | 0 | 0 |
| -0.136999999999999 | 0 | 0 | 0 |
| -0.135999999999999 | 0 | 0 | 0 |
| -0.134999999999999 | 0 | 0 | 0 |
| -0.133999999999999 | 0 | 0 | 0 |
| -0.132999999999999 | 0 | 0 | 0 |
| -0.131999999999999 | 0 | 0 | 0 |
| -0.130999999999999 | 0 | 0 | 0 |
| -0.129999999999999 | 0 | 0 | 0 |
| -0.128999999999999 | 0 | 0 | 0 |
| -0.127999999999999 | 0 | 0 | 0 |
| -0.126999999999999 | 0 | 0 | 0 |
| -0.125999999999999 | 0 | 0 | 0 |
| -0.124999999999999 | 0 | 0 | 0 |
| -0.123999999999999 | 0 | 0 | 0 |
| -0.122999999999999 | 0 | 0 | 0 |
| -0.121999999999999 | 0 | 0 | 0 |
| -0.120999999999999 | 0 | 0 | 0 |
| -0.119999999999999 | 0 | 0 | 0 |
| -0.118999999999999 | 0 | 0 | 0 |
| -0.117999999999999 | 0 | 0 | 0 |
| -0.116999999999999 | 0 | 0 | 0 |
| -0.115999999999999 | 0 | 0 | 0 |
| -0.114999999999999 | 0 | 0 | 0 |
| -0.113999999999999 | 0 | 0 | 0 |
| -0.112999999999999 | 0 | 0 | 0 |
| -0.111999999999999 | 0 | 0 | 0 |
| -0.110999999999999 | 0 | 0 | 0 |
| -0.109999999999999 | 0 | 0 | 0 |
| -0.108999999999999 | 0 | 0 | 0 |
| -0.107999999999999 | 0 | 0 | 0 |
| -0.106999999999999 | 0 | 0 | 0 |
| -0.105999999999999 | 0 | 0 | 0 |
| -0.104999999999999 | 0 | 0 | 0 |
| -0.103999999999999 | 0 | 0 | 0 |
| -0.102999999999999 | 0 | 0 | 0 |
| -0.101999999999999 | 0 | 0 | 0 |
| -0.100999999999999 | 0 | 0 | 0 |
| -0.0999999999999992 | 0 | 0 | 0 |
| -0.0989999999999992 | 0 | 0 | 0 |
| -0.0979999999999992 | 0 | 0 | 0 |
| -0.0969999999999992 | 0 | 0 | 0 |
| -0.0959999999999992 | 0 | 0 | 0 |
| -0.0949999999999992 | 0 | 0 | 0 |
| -0.0939999999999992 | 0 | 0 | 0 |
| -0.0929999999999992 | 0 | 0 | 0 |
| -0.0919999999999992 | 0 | 0 | 0 |
| -0.0909999999999992 | 0 | 0 | 0 |
| -0.0899999999999992 | 0 | 0 | 0 |
| -0.0889999999999992 | 0 | 0 | 0 |
| -0.0879999999999992 | 0 | 0 | 0 |
| -0.0869999999999992 | 0 | 0 | 0 |
| -0.0859999999999992 | 0 | 0 | 0 |
| -0.0849999999999992 | 0 | 0 | 0 |
| -0.0839999999999992 | 0 | 0 | 0 |
| -0.0829999999999992 | 0 | 0 | 0 |
| -0.0819999999999992 | 0 | 0 | 0 |
| -0.0809999999999992 | 0 | 0 | 0 |
| -0.0799999999999992 | 0 | 0 | 0 |
| -0.0789999999999992 | 0 | 0 | 0 |
| -0.0779999999999992 | 0 | 0 | 0 |
| -0.0769999999999992 | 0 | 0 | 0 |
| -0.0759999999999992 | 0 | 0 | 0 |
| -0.0749999999999992 | 0 | 0 | 0 |
| -0.0739999999999992 | 0 | 0 | 0 |
| -0.0729999999999992 | 0 | 0 | 0 |
| -0.0719999999999992 | 0 | 0 | 0 |
| -0.0709999999999992 | 0 | 0 | 0 |
| -0.0699999999999992 | 0 | 0 | 0 |
| -0.0689999999999992 | 0 | 0 | 0 |
| -0.0679999999999992 | 0 | 0 | 0 |
| -0.0669999999999992 | 0 | 0 | 0 |
| -0.0659999999999992 | 0 | 0 | 0 |
| -0.0649999999999992 | 0 | 0 | 0 |
| -0.0639999999999992 | 0 | 0 | 0 |
| -0.0629999999999992 | 0 | 0 | 0 |
| -0.0619999999999992 | 0 | 0 | 0 |
| -0.0609999999999992 | 0 | 0 | 0 |
| -0.0599999999999992 | 0 | 0 | 0 |
| -0.0589999999999992 | 0 | 0 | 0 |
| -0.0579999999999992 | 0 | 0 | 0 |
| -0.0569999999999992 | 0 | 0 | 0 |
| -0.0559999999999992 | 0 | 0 | 0 |
| -0.0549999999999991 | 0 | 0 | 0 |
| -0.0539999999999991 | 0 | 0 | 0 |
| -0.0529999999999991 | 0 | 0 | 0 |
| -0.0519999999999991 | 0 | 0 | 0 |
| -0.0509999999999991 | 0 | 0 | 0 |
| -0.0499999999999991 | 0 | 0 | 0 |
| -0.0489999999999991 | 0 | 0 | 0 |
| -0.0479999999999991 | 0 | 0 | 0 |
| -0.0469999999999991 | 0 | 0 | 0 |
| -0.0459999999999991 | 0 | 0 | 0 |
| -0.0449999999999991 | 0 | 0 | 0 |
| -0.0439999999999991 | 0 | 0 | 0 |
| -0.0429999999999991 | 0 | 0 | 0 |
| -0.0419999999999991 | 0 | 0 | 0 |
| -0.0409999999999991 | 0 | 0 | 0 |
| -0.0399999999999991 | 0 | 0 | 0 |
| -0.0389999999999991 | 0 | 0 | 0 |
| -0.0379999999999991 | 0 | 0 | 0 |
| -0.0369999999999991 | 0 | 0 | 0 |
| -0.0359999999999991 | 0 | 0 | 0 |
| -0.0349999999999991 | 0 | 0 | 0 |
| -0.0339999999999991 | 0 | 0 | 0 |
| -0.0329999999999991 | 0 | 0 | 0 |
| -0.0319999999999991 | 0 | 0 | 0 |
| -0.0309999999999991 | 0 | 0 | 0 |
| -0.0299999999999991 | 0 | 0 | 0 |
| -0.0289999999999991 | 0 | 0 | 0 |
| -0.0279999999999991 | 0 | 0 | 0 |
| -0.0269999999999991 | 0 | 0 | 0 |
| -0.0259999999999991 | 0 | 0 | 0 |
| -0.0249999999999991 | 0 | 0 | 0 |
| -0.0239999999999991 | 0 | 0 | 0 |
| -0.0229999999999991 | 0 | 0 | 0 |
| -0.0219999999999991 | 0 | 0 | 0 |
| -0.0209999999999991 | 0 | 0 | 0 |
| -0.0199999999999991 | 0 | 0 | 0 |
| -0.0189999999999991 | 0 | 0 | 0 |
| -0.0179999999999991 | 0 | 0 | 0 |
| -0.0169999999999991 | 0 | 0 | 0 |
| -0.0159999999999991 | 0 | 0 | 0 |
| -0.0149999999999991 | 0 | 0 | 0 |
| -0.0139999999999991 | 0 | 0 | 0 |
| -0.0129999999999991 | 0 | 0 | 0 |
| -0.0119999999999991 | 0 | 0 | 0 |
| -0.0109999999999991 | 0 | 0 | 0 |
| -0.00999999999999912 | 0 | 0 | 0 |
| -0.00899999999999912 | 0 | 0 | 0 |
| -0.00799999999999912 | 0 | 0 | 0 |
| -0.00699999999999912 | 0 | 0 | 0 |
| -0.00599999999999912 | 0 | 0 | 0 |
| -0.00499999999999912 | 0 | 0 | 0 |
| -0.00399999999999912 | 0 | 0 | 0 |
| -0.00299999999999912 | 0 | 0 | 0 |
| -0.00199999999999912 | 0 | 0 | 0 |
| -0.000999999999999118 | 0 | 0 | 0 |
| 8.81239525796218e-16 | 0 | 0 | 0 |
| 0.00100000000000088 | 0 | 0 | 0 |
| 0.00200000000000088 | 0 | 0 | 0 |
| 0.00300000000000088 | 0 | 0 | 0 |
| 0.00400000000000088 | 0 | 0 | 0 |
| 0.00500000000000088 | 0 | 0 | 0 |
| 0.00600000000000088 | 0 | 0 | 0 |
| 0.00700000000000088 | 0 | 0 | 0 |
| 0.00800000000000088 | 0 | 0 | 0 |
| 0.00900000000000088 | 0 | 0 | 0 |
| 0.0100000000000009 | 0 | 0 | 0 |
| 0.0110000000000009 | 0 | 0 | 0 |
| 0.0120000000000009 | 0 | 0 | 0 |
| 0.0130000000000009 | 0 | 0 | 0 |
| 0.0140000000000009 | 0 | 0 | 0 |
| 0.0150000000000009 | 0 | 0 | 0 |
| 0.0160000000000009 | 0 | 0 | 0 |
| 0.0170000000000009 | 0 | 0 | 0 |
| 0.0180000000000009 | 0 | 0 | 0 |
| 0.0190000000000009 | 0 | 0 | 0 |
| 0.0200000000000009 | 0 | 0 | 0 |
| 0.0210000000000009 | 0 | 0 | 0 |
| 0.0220000000000009 | 0 | 0 | 0 |
| 0.0230000000000009 | 0 | 0 | 0 |
| 0.0240000000000009 | 0 | 0 | 0 |
| 0.0250000000000009 | 0 | 0 | 0 |
| 0.0260000000000009 | 0 | 0 | 0 |
| 0.0270000000000009 | 0 | 0 | 0 |
| 0.0280000000000009 | 0 | 0 | 0 |
| 0.0290000000000009 | 0 | 0 | 0 |
| 0.0300000000000009 | 0 | 0 | 0 |
| 0.0310000000000009 | 0 | 0 | 0 |
| 0.0320000000000009 | 0 | 0 | 0 |
| 0.0330000000000009 | 0 | 0 | 0 |
| 0.0340000000000009 | 0 | 0 | 0 |
| 0.0350000000000009 | 0 | 0 | 0 |
| 0.0360000000000009 | 0 | 0 | 0 |
| 0.0370000000000009 | 0 | 0 | 0 |
| 0.0380000000000009 | 0 | 0 | 0 |
| 0.0390000000000009 | 0 | 0 | 0 |
| 0.0400000000000009 | 0 | 0 | 0 |
| 0.0410000000000009 | 0 | 0 | 0 |
| 0.0420000000000009 | 0 | 0 | 0 |
| 0.0430000000000009 | 0 | 0 | 0 |
| 0.0440000000000009 | 0 | 0 | 0 |
| 0.0450000000000009 | 0 | 0 | 0 |
| 0.0460000000000009 | 0 | 0 | 0 |
| 0.0470000000000009 | 0 | 0 | 0 |
| 0.0480000000000009 | 0 | 0 | 0 |
| 0.0490000000000009 | 0 | 0 | 0 |
| 0.0500000000000009 | 0 | 0 | 0 |
| 0.0510000000000009 | 0 | 0 | 0 |
| 0.0520000000000009 | 0 | 0 | 0 |
| 0.0530000000000009 | 0 | 0 | 0 |
| 0.0540000000000009 | 0 | 0 | 0 |
| 0.0550000000000009 | 0 | 0 | 0 |
| 0.0560000000000009 | 0 | 0 | 0 |
| 0.0570000000000009 | 0 | 0 | 0 |
| 0.0580000000000009 | 0 | 0 | 0 |
| 0.0590000000000009 | 0 | 0 | 0 |
| 0.0600000000000009 | 0 | 0 | 0 |
| 0.0610000000000009 | 0 | 0 | 0 |
| 0.0620000000000009 | 0 | 0 | 0 |
| 0.0630000000000009 | 0 | 0 | 0 |
| 0.0640000000000009 | 0 | 0 | 0 |
| 0.0650000000000009 | 0 | 0 | 0 |
| 0.0660000000000009 | 0 | 0 | 0 |
| 0.0670000000000009 | 0 | 0 | 0 |
| 0.0680000000000009 | 0 | 0 | 0 |
| 0.0690000000000009 | 0 | 0 | 0 |
| 0.0700000000000009 | 0 | 0 | 0 |
| 0.0710000000000009 | 0 | 0 | 0 |
| 0.0720000000000009 | 0 | 0 | 0 |
| 0.0730000000000009 | 0 | 0 | 0 |
| 0.0740000000000009 | 0 | 0 | 0 |
| 0.0750000000000009 | 0 | 0 | 0 |
| 0.0760000000000009 | 0 | 0 | 0 |
| 0.0770000000000009 | 0 | 0 | 0 |
| 0.0780000000000009 | 0 | 0 | 0 |
| 0.0790000000000009 | 0 | 0 | 0 |
| 0.0800000000000009 | 0 | 0 | 0 |
| 0.0810000000000009 | 0 | 0 | 0 |
| 0.0820000000000009 | 0 | 0 | 0 |
| 0.0830000000000009 | 0 | 0 | 0 |
| 0.0840000000000009 | 0 | 0 | 0 |
| 0.0850000000000009 | 0 | 0 | 0 |
| 0.0860000000000009 | 0 | 0 | 0 |
| 0.0870000000000009 | 0 | 0 | 0 |
| 0.0880000000000009 | 0 | 0 | 0 |
| 0.0890000000000009 | 0 | 0 | 0 |
| 0.0900000000000009 | 0 | 0 | 0 |
| 0.0910000000000009 | 0 | 0 | 0 |
| 0.0920000000000009 | 0 | 0 | 0 |
| 0.0930000000000009 | 0 | 0 | 0 |
| 0.0940000000000009 | 0 | 0 | 0 |
| 0.0950000000000009 | 0 | 0 | 0 |
| 0.0960000000000009 | 0 | 0 | 0 |
| 0.0970000000000009 | 0 | 0 | 0 |
| 0.0980000000000009 | 0 | 0 | 0 |
| 0.0990000000000009 | 0 | 0 | 0 |
| 0.100000000000001 | 0 | 0 | 0 |
| 0.101000000000001 | 0 | 0 | 0 |
| 0.102000000000001 | 0 | 0 | 0 |
| 0.103000000000001 | 0 | 0 | 0 |
| 0.104000000000001 | 0 | 0 | 0 |
| 0.105000000000001 | 0 | 0 | 0 |
| 0.106000000000001 | 0 | 0 | 0 |
| 0.107000000000001 | 0 | 0 | 0 |
| 0.108000000000001 | 0 | 0 | 0 |
| 0.109000000000001 | 0 | 0 | 0 |
| 0.110000000000001 | 0 | 0 | 0 |
| 0.111000000000001 | 0 | 0 | 0 |
| 0.112000000000001 | 0 | 0 | 0 |
| 0.113000000000001 | 0 | 0 | 0 |
| 0.114000000000001 | 0 | 0 | 0 |
| 0.115000000000001 | 0 | 0 | 0 |
| 0.116000000000001 | 0 | 0 | 0 |
| 0.117000000000001 | 0 | 0 | 0 |
| 0.118000000000001 | 0 | 0 | 0 |
| 0.119000000000001 | 0 | 0 | 0 |
| 0.120000000000001 | 0 | 0 | 0 |
| 0.121000000000001 | 0 | 0 | 0 |
| 0.122000000000001 | 0 | 0 | 0 |
| 0.123000000000001 | 0 | 0 | 0 |
| 0.124000000000001 | 0 | 0 | 0 |
| 0.125000000000001 | 0 | 0 | 0 |
| 0.126000000000001 | 0 | 0 | 0 |
| 0.127000000000001 | 0 | 0 | 0 |
| 0.128000000000001 | 0 | 0 | 0 |
| 0.129000000000001 | 0 | 0 | 0 |
| 0.130000000000001 | 0 | 0 | 0 |
| 0.131000000000001 | 0 | 0 | 0 |
| 0.132000000000001 | 0 | 0 | 0 |
| 0.133000000000001 | 0 | 0 | 0 |
| 0.134000000000001 | 0 | 0 | 0 |
| 0.135000000000001 | 0 | 0 | 0 |
| 0.136000000000001 | 0 | 0 | 0 |
| 0.137000000000001 | 0 | 0 | 0 |
| 0.138000000000001 | 0 | 0 | 0 |
| 0.139000000000001 | 0 | 0 | 0 |
| 0.140000000000001 | 0 | 0 | 0 |
| 0.141000000000001 | 0 | 0 | 0 |
| 0.142000000000001 | 0 | 0 | 0 |
| 0.143000000000001 | 0 | 0 | 0 |
| 0.144000000000001 | 0 | 0 | 0 |
| 0.145000000000001 | 0 | 0 | 0 |
| 0.146000000000001 | 0 | 0 | 0 |
| 0.147000000000001 | 0 | 0 | 0 |
| 0.148000000000001 | 0 | 0 | 0 |
| 0.149000000000001 | 0 | 0 | 0 |
| 0.150000000000001 | 0 | 0 | 0 |
| 0.151000000000001 | 0 | 0 | 0 |
| 0.152000000000001 | 0 | 0 | 0 |
| 0.153000000000001 | 0 | 0 | 0 |
| 0.154000000000001 | 0 | 0 | 0 |
| 0.155000000000001 | 0 | 0 | 0 |
| 0.156000000000001 | 0 | 0 | 0 |
| 0.157000000000001 | 0 | 0 | 0 |
| 0.158000000000001 | 0 | 0 | 0 |
| 0.159000000000001 | 0 | 0 | 0 |
| 0.160000000000001 | 0 | 0 | 0 |
| 0.161000000000001 | 0 | 0 | 0 |
| 0.162000000000001 | 0 | 0 | 0 |
| 0.163000000000001 | 0 | 0 | 0 |
| 0.164000000000001 | 0 | 0 | 0 |
| 0.165000000000001 | 0 | 0 | 0 |
| 0.166000000000001 | 0 | 0 | 0 |
| 0.167000000000001 | 0 | 0 | 0 |
| 0.168000000000001 | 0 | 0 | 0 |
| 0.169000000000001 | 0 | 0 | 0 |
| 0.170000000000001 | 0 | 0 | 0 |
| 0.171000000000001 | 0 | 0 | 0 |
| 0.172000000000001 | 0 | 0 | 0 |
| 0.173000000000001 | 0 | 0 | 0 |
| 0.174000000000001 | 0 | 0 | 0 |
| 0.175000000000001 | 0 | 0 | 0 |
| 0.176000000000001 | 0 | 0 | 0 |
| 0.177000000000001 | 0 | 0 | 0 |
| 0.178000000000001 | 0 | 0 | 0 |
| 0.179000000000001 | 0 | 0 | 0 |
| 0.180000000000001 | 0 | 0 | 0 |
| 0.181000000000001 | 0 | 0 | 0 |
| 0.182000000000001 | 0 | 0 | 0 |
| 0.183000000000001 | 0 | 0 | 0 |
| 0.184000000000001 | 0 | 0 | 0 |
| 0.185000000000001 | 0 | 0 | 0 |
| 0.186000000000001 | 0 | 0 | 0 |
| 0.187000000000001 | 0 | 0 | 0 |
| 0.188000000000001 | 0 | 0 | 0 |
| 0.189000000000001 | 0 | 0 | 0 |
| 0.190000000000001 | 0 | 0 | 0 |
| 0.191000000000001 | 0 | 0 | 0 |
| 0.192000000000001 | 0 | 0 | 0 |
| 0.193000000000001 | 0 | 0 | 0 |
| 0.194000000000001 | 0 | 0 | 0 |
| 0.195000000000001 | 0 | 0 | 0 |
| 0.196000000000001 | 0 | 0 | 0 |
| 0.197000000000001 | 0 | 0 | 0 |
| 0.198000000000001 | 0 | 0 | 0 |
| 0.199000000000001 | 0 | 0 | 0 |
| 0.200000000000001 | 0 | 0 | 0 |
| 0.201000000000001 | 0 | 0 | 0 |
| 0.202000000000001 | 0 | 0 | 0 |
| 0.203000000000001 | 0 | 0 | 0 |
| 0.204000000000001 | 0 | 0 | 0 |
| 0.205000000000001 | 0 | 0 | 0 |
| 0.206000000000001 | 0 | 0 | 0 |
| 0.207000000000001 | 0 | 0 | 0 |
| 0.208000000000001 | 0 | 0 | 0 |
| 0.209000000000001 | 0 | 0 | 0 |
| 0.210000000000001 | 0 | 0 | 0 |
| 0.211000000000001 | 0 | 0 | 0 |
| 0.212000000000001 | 0 | 0 | 0 |
| 0.213000000000001 | 0 | 0 | 0 |
| 0.214000000000001 | 0 | 0 | 0 |
| 0.215000000000001 | 0 | 0 | 0 |
| 0.216000000000001 | 0 | 0 | 0 |
| 0.217000000000001 | 0 | 0 | 0 |
| 0.218000000000001 | 0 | 0 | 0 |
| 0.219000000000001 | 0 | 0 | 0 |
| 0.220000000000001 | 0 | 0 | 0 |
| 0.221000000000001 | 0 | 0 | 0 |
| 0.222000000000001 | 0 | 0 | 0 |
| 0.223000000000001 | 0 | 0 | 0 |
| 0.224000000000001 | 0 | 0 | 0 |
| 0.225000000000001 | 0 | 0 | 0 |
| 0.226000000000001 | 0 | 0 | 0 |
| 0.227000000000001 | 0 | 0 | 0 |
| 0.228000000000001 | 0 | 0 | 0 |
| 0.229000000000001 | 0 | 0 | 0 |
| 0.230000000000001 | 0 | 0 | 0 |
| 0.231000000000001 | 0 | 0 | 0 |
| 0.232000000000001 | 0 | 0 | 0 |
| 0.233000000000001 | 0 | 0 | 0 |
| 0.234000000000001 | 0 | 0 | 0 |
| 0.235000000000001 | 0 | 0 | 0 |
| 0.236000000000001 | 0 | 0 | 0 |
| 0.237000000000001 | 0 | 0 | 0 |
| 0.238000000000001 | 0 | 0 | 0 |
| 0.239000000000001 | 0 | 0 | 0 |
| 0.240000000000001 | 0 | 0 | 0 |
| 0.241000000000001 | 0 | 0 | 0 |
| 0.242000000000001 | 0 | 0 | 0 |
| 0.243000000000001 | 0 | 0 | 0 |
| 0.244000000000001 | 0 | 0 | 0 |
| 0.245000000000001 | 0 | 0 | 0 |
| 0.246000000000001 | 0 | 0 | 0 |
| 0.247000000000001 | 0 | 0 | 0 |
| 0.248000000000001 | 0 | 0 | 0 |
| 0.249000000000001 | 0 | 0 | 0 |
| 0.250000000000001 | 0 | 0 | 0 |
| 0.251000000000001 | 0 | 0 | 0 |
| 0.252000000000001 | 0 | 0 | 0 |
| 0.253000000000001 | 0 | 0 | 0 |
| 0.254000000000001 | 0 | 0 | 0 |
| 0.255000000000001 | 0 | 0 | 0 |
| 0.256000000000001 | 0 | 0 | 0 |
| 0.257000000000001 | 0 | 0 | 0 |
| 0.258000000000001 | 0 | 0 | 0 |
| 0.259000000000001 | 0 | 0 | 0 |
| 0.260000000000001 | 0 | 0 | 0 |
| 0.261000000000001 | 0 | 0 | 0 |
| 0.262000000000001 | 0 | 0 | 0 |
| 0.263000000000001 | 0 | 0 | 0 |
| 0.264000000000001 | 0 | 0 | 0 |
| 0.265000000000001 | 0 | 0 | 0 |
| 0.266000000000001 | 0 | 0 | 0 |
| 0.267000000000001 | 0 | 0 | 0 |
| 0.268000000000001 | 0 | 0 | 0 |
| 0.269000000000001 | 0 | 0 | 0 |
| 0.270000000000001 | 0 | 0 | 0 |
| 0.271000000000001 | 0 | 0 | 0 |
| 0.272000000000001 | 0 | 0 | 0 |
| 0.273000000000001 | 0 | 0 | 0 |
| 0.274000000000001 | 0 | 0 | 0 |
| 0.275000000000001 | 0 | 0 | 0 |
| 0.276000000000001 | 0 | 0 | 0 |
| 0.277000000000001 | 0 | 0 | 0 |
| 0.278000000000001 | 0 | 0 | 0 |
| 0.279000000000001 | 0 | 0 | 0 |
| 0.280000000000001 | 0 | 0 | 0 |
| 0.281000000000001 | 0 | 0 | 0 |
| 0.282000000000001 | 0 | 0 | 0 |
| 0.283000000000001 | 0 | 0 | 0 |
| 0.284000000000001 | 0 | 0 | 0 |
| 0.285000000000001 | 0 | 0 | 0 |
| 0.286000000000001 | 0 | 0 | 0 |
| 0.287000000000001 | 0 | 0 | 0 |
| 0.288000000000001 | 0 | 0 | 0 |
| 0.289000000000001 | 0 | 0 | 0 |
| 0.290000000000001 | 0 | 0 | 0 |
| 0.291000000000001 | 0 | 0 | 0 |
| 0.292000000000001 | 0 | 0 | 0 |
| 0.293000000000001 | 0 | 0 | 0 |
| 0.294000000000001 | 0 | 0 | 0 |
| 0.295000000000001 | 0 | 0 | 0 |
| 0.296000000000001 | 0 | 0 | 0 |
| 0.297000000000001 | 0 | 0 | 0 |
| 0.298000000000001 | 0 | 0 | 0 |
| 0.299000000000001 | 0 | 0 | 0 |
| 0.300000000000001 | 0 | 0 | 0 |
| 0.301000000000001 | 0 | 0 | 0 |
| 0.302000000000001 | 0 | 0 | 0 |
| 0.303000000000001 | 0 | 0 | 0 |
| 0.304000000000001 | 0 | 0 | 0 |
| 0.305000000000001 | 0 | 0 | 0 |
| 0.306000000000001 | 0 | 0 | 0 |
| 0.307000000000001 | 0 | 0 | 0 |
| 0.308000000000001 | 0 | 0 | 0 |
| 0.309000000000001 | 0 | 0 | 0 |
| 0.310000000000001 | 0 | 0 | 0 |
| 0.311000000000001 | 0 | 0 | 0 |
| 0.312000000000001 | 0 | 0 | 0 |
| 0.313000000000001 | 0 | 0 | 0 |
| 0.314000000000001 | 0 | 0 | 0 |
| 0.315000000000001 | 0 | 0 | 0 |
| 0.316000000000001 | 0 | 0 | 0 |
| 0.317000000000001 | 0 | 0 | 0 |
| 0.318000000000001 | 0 | 0 | 0 |
| 0.319000000000001 | 0 | 0 | 0 |
| 0.320000000000001 | 0 | 0 | 0 |
| 0.321000000000001 | 0 | 0 | 0 |
| 0.322000000000001 | 0 | 0 | 0 |
| 0.323000000000001 | 0 | 0 | 0 |
| 0.324000000000001 | 0 | 0 | 0 |
| 0.325000000000001 | 0 | 0 | 0 |
| 0.326000000000001 | 0 | 0 | 0 |
| 0.327000000000001 | 0 | 0 | 0 |
| 0.328000000000001 | 0 | 0 | 0 |
| 0.329000000000001 | 0 | 0 | 0 |
| 0.330000000000001 | 0 | 0 | 0 |
| 0.331000000000001 | 0 | 0 | 0 |
| 0.332000000000001 | 0 | 0 | 0 |
| 0.333000000000001 | 0 | 0 | 0 |
| 0.334000000000001 | 0 | 0 | 0 |
| 0.335000000000001 | 0 | 0 | 0 |
| 0.336000000000001 | 0 | 0 | 0 |
| 0.337000000000001 | 0 | 0 | 0 |
| 0.338000000000001 | 0 | 0 | 0 |
| 0.339000000000001 | 0 | 0 | 0 |
| 0.340000000000001 | 0 | 0 | 0 |
| 0.341000000000001 | 0 | 0 | 0 |
| 0.342000000000001 | 0 | 0 | 0 |
| 0.343000000000001 | 0 | 0 | 0 |
| 0.344000000000001 | 0 | 0 | 0 |
| 0.345000000000001 | 0 | 0 | 0 |
| 0.346000000000001 | 0 | 0 | 0 |
| 0.347000000000001 | 0 | 0 | 0 |
| 0.348000000000001 | 0 | 0 | 0 |
| 0.349000000000001 | 0 | 0 | 0 |
| 0.350000000000001 | 0 | 0 | 0 |
| 0.351000000000001 | 0 | 0 | 0 |
| 0.352000000000001 | 0 | 0 | 0 |
| 0.353000000000001 | 0 | 0 | 0 |
| 0.354000000000001 | 0 | 0 | 0 |
| 0.355000000000001 | 0 | 0 | 0 |
| 0.356000000000001 | 0 | 0 | 0 |
| 0.357000000000001 | 0 | 0 | 0 |
| 0.358000000000001 | 0 | 0 | 0 |
| 0.359000000000001 | 0 | 0 | 0 |
| 0.360000000000001 | 0 | 0 | 0 |
| 0.361000000000001 | 0 | 0 | 0 |
| 0.362000000000001 | 0 | 0 | 0 |
| 0.363000000000001 | 0 | 0 | 0 |
| 0.364000000000001 | 0 | 0 | 0 |
| 0.365000000000001 | 0 | 0 | 0 |
| 0.366000000000001 | 0 | 0 | 0 |
| 0.367000000000001 | 0 | 0 | 0 |
| 0.368000000000001 | 0 | 0 | 0 |
| 0.369000000000001 | 0 | 0 | 0 |
| 0.370000000000001 | 0 | 0 | 0 |
| 0.371000000000001 | 0 | 0 | 0 |
| 0.372000000000001 | 0 | 0 | 0 |
| 0.373000000000001 | 0 | 0 | 0 |
| 0.374000000000001 | 0 | 0 | 0 |
| 0.375000000000001 | 0 | 0 | 0 |
| 0.376000000000001 | 0 | 0 | 0 |
| 0.377000000000001 | 0 | 0 | 0 |
| 0.378000000000001 | 0 | 0 | 0 |
| 0.379000000000001 | 0 | 0 | 0 |
| 0.380000000000001 | 0 | 0 | 0 |
| 0.381000000000001 | 0 | 0 | 0 |
| 0.382000000000001 | 0 | 0 | 0 |
| 0.383000000000001 | 0 | 0 | 0 |
| 0.384000000000001 | 0 | 0 | 0 |
| 0.385000000000001 | 0 | 0 | 0 |
| 0.386000000000001 | 0 | 0 | 0 |
| 0.387000000000001 | 0 | 0 | 0 |
| 0.388000000000001 | 0 | 0 | 0 |
| 0.389000000000001 | 0 | 0 | 0 |
| 0.390000000000001 | 0 | 0 | 0 |
| 0.391000000000001 | 0 | 0 | 0 |
| 0.392000000000001 | 0 | 0 | 0 |
| 0.393000000000001 | 0 | 0 | 0 |
| 0.394000000000001 | 0 | 0 | 0 |
| 0.395000000000001 | 0 | 0 | 0 |
| 0.396000000000001 | 0 | 0 | 0 |
| 0.397000000000001 | 0 | 0 | 0 |
| 0.398000000000001 | 0 | 0 | 0 |
| 0.399000000000001 | 0 | 0 | 0 |
| 0.400000000000001 | 0 | 0 | 0 |
| 0.401000000000001 | 0 | 0 | 0 |
| 0.402000000000001 | 0 | 0 | 0 |
| 0.403000000000001 | 0 | 0 | 0 |
| 0.404000000000001 | 0 | 0 | 0 |
| 0.405000000000001 | 0 | 0 | 0 |
| 0.406000000000001 | 0 | 0 | 0 |
| 0.407000000000001 | 0 | 0 | 0 |
| 0.408000000000001 | 0 | 0 | 0 |
| 0.409000000000001 | 0 | 0 | 0 |
| 0.410000000000001 | 0 | 0 | 0 |
| 0.411000000000001 | 0 | 0 | 0 |
| 0.412000000000001 | 0 | 0 | 0 |
| 0.413000000000001 | 0 | 0 | 0 |
| 0.414000000000001 | 0 | 0 | 0 |
| 0.415000000000001 | 0 | 0 | 0 |
| 0.416000000000001 | 0 | 0 | 0 |
| 0.417000000000001 | 0 | 0 | 0 |
| 0.418000000000001 | 0 | 0 | 0 |
| 0.419000000000001 | 0 | 0 | 0 |
| 0.420000000000001 | 0 | 0 | 0 |
| 0.421000000000001 | 0 | 0 | 0 |
| 0.422000000000001 | 0 | 0 | 0 |
| 0.423000000000001 | 0 | 0 | 0 |
| 0.424000000000001 | 0 | 0 | 0 |
| 0.425000000000001 | 0 | 0 | 0 |
| 0.426000000000001 | 0 | 0 | 0 |
| 0.427000000000001 | 0 | 0 | 0 |
| 0.428000000000001 | 0 | 0 | 0 |
| 0.429000000000001 | 0 | 0 | 0 |
| 0.430000000000001 | 0 | 0 | 0 |
| 0.431000000000001 | 0 | 0 | 0 |
| 0.432000000000001 | 0 | 0 | 0 |
| 0.433000000000001 | 0 | 0 | 0 |
| 0.434000000000001 | 0 | 0 | 0 |
| 0.435000000000001 | 0 | 0 | 0 |
| 0.436000000000001 | 0 | 0 | 0 |
| 0.437000000000001 | 0 | 0 | 0 |
| 0.438000000000001 | 0 | 0 | 0 |
| 0.439000000000001 | 0 | 0 | 0 |
| 0.440000000000001 | 0 | 0 | 0 |
| 0.441000000000001 | 0 | 0 | 0 |
| 0.442000000000001 | 0 | 0 | 0 |
| 0.443000000000001 | 0 | 0 | 0 |
| 0.444000000000001 | 0 | 0 | 0 |
| 0.445000000000001 | 0 | 0 | 0 |
| 0.446000000000001 | 0 | 0 | 0 |
| 0.447000000000001 | 0 | 0 | 0 |
| 0.448000000000001 | 0 | 0 | 0 |
| 0.449000000000001 | 0 | 0 | 0 |
| 0.450000000000001 | 0 | 0 | 0 |
| 0.451000000000001 | 0 | 0 | 0 |
| 0.452000000000001 | 0 | 0 | 0 |
| 0.453000000000001 | 0 | 0 | 0 |
| 0.454000000000001 | 0 | 0 | 0 |
| 0.455000000000001 | 0 | 0 | 0 |
| 0.456000000000001 | 0 | 0 | 0 |
| 0.457000000000001 | 0 | 0 | 0 |
| 0.458000000000001 | 0 | 0 | 0 |
| 0.459000000000001 | 0 | 0 | 0 |
| 0.460000000000001 | 0 | 0 | 0 |
| 0.461000000000001 | 0 | 0 | 0 |
| 0.462000000000001 | 0 | 0 | 0 |
| 0.463000000000001 | 0 | 0 | 0 |
| 0.464000000000001 | 0 | 0 | 0 |
| 0.465000000000001 | 0 | 0 | 0 |
| 0.466000000000001 | 0 | 0 | 0 |
| 0.467000000000001 | 0 | 0 | 0 |
| 0.468000000000001 | 0 | 0 | 0 |
| 0.469000000000001 | 0 | 0 | 0 |
| 0.470000000000001 | 0 | 0 | 0 |
| 0.471000000000001 | 0 | 0 | 0 |
| 0.472000000000001 | 0 | 0 | 0 |
| 0.473000000000001 | 0 | 0 | 0 |
| 0.474000000000001 | 0 | 0 | 0 |
| 0.475000000000001 | 0 | 0 | 0 |
| 0.476000000000001 | 0 | 0 | 0 |
| 0.477000000000001 | 0 | 0 | 0 |
| 0.478000000000001 | 0 | 0 | 0 |
| 0.479000000000001 | 0 | 0 | 0 |
| 0.480000000000001 | 0 | 0 | 0 |
| 0.481000000000001 | 0 | 0 | 0 |
| 0.482000000000001 | 0 | 0 | 0 |
| 0.483000000000001 | 0 | 0 | 0 |
| 0.484000000000001 | 0 | 0 | 0 |
| 0.485000000000001 | 0 | 0 | 0 |
| 0.486000000000001 | 0 | 0 | 0 |
| 0.487000000000001 | 0 | 0 | 0 |
| 0.488000000000001 | 0 | 0 | 0 |
| 0.489000000000001 | 0 | 0 | 0 |
| 0.490000000000001 | 0 | 0 | 0 |
| 0.491000000000001 | 0 | 0 | 0 |
| 0.492000000000001 | 0 | 0 | 0 |
| 0.493000000000001 | 0 | 0 | 0 |
| 0.494000000000001 | 0 | 0 | 0 |
| 0.495000000000001 | 0 | 0 | 0 |
| 0.496000000000001 | 0 | 0 | 0 |
| 0.497000000000001 | 0 | 0 | 0 |
| 0.498000000000001 | 0 | 0 | 0 |
| 0.499000000000001 | 0 | 0 | 0 |
| 0.500000000000001 | 0 | 0 | 0 |
| 0.501000000000001 | 0 | 0 | 0 |
| 0.502000000000001 | 0.001 | 0 | 0 |
| 0.503000000000001 | 0.001 | 0 | 0 |
| 0.504000000000001 | 0.001 | 0 | 0 |
| 0.505000000000001 | 0.001 | 0 | 0 |
| 0.506000000000001 | 0.001 | 0 | 0 |
| 0.507000000000001 | 0.001 | 0 | 0 |
| 0.508000000000001 | 0.001 | 0 | 0 |
| 0.509000000000001 | 0.001 | 0 | 0 |
| 0.510000000000001 | 0.001 | 0 | 0 |
| 0.511000000000001 | 0.001 | 0 | 0 |
| 0.512000000000001 | 0.001 | 0 | 0 |
| 0.513000000000001 | 0.001 | 0 | 0 |
| 0.514000000000001 | 0.001 | 0 | 0 |
| 0.515000000000001 | 0.001 | 0 | 0 |
| 0.516000000000001 | 0.001 | 0 | 0 |
| 0.517000000000001 | 0.001 | 0 | 0 |
| 0.518000000000001 | 0.001 | 0 | 0 |
| 0.519000000000001 | 0.001 | 0 | 0 |
| 0.520000000000001 | 0.001 | 0 | 0 |
| 0.521000000000001 | 0.001 | 0 | 0 |
| 0.522000000000001 | 0.001 | 0 | 0 |
| 0.523000000000001 | 0.001 | 0 | 0 |
| 0.524000000000001 | 0.001 | 0 | 0 |
| 0.525000000000001 | 0.001 | 0 | 0 |
| 0.526000000000001 | 0.001 | 0 | 0 |
| 0.527000000000001 | 0.001 | 0 | 0 |
| 0.528000000000001 | 0.001 | 0 | 0 |
| 0.529000000000001 | 0.001 | 0 | 0 |
| 0.530000000000001 | 0.001 | 0 | 0 |
| 0.531000000000001 | 0.001 | 0 | 0 |
| 0.532000000000001 | 0.001 | 0 | 0 |
| 0.533000000000001 | 0.001 | 0 | 0 |
| 0.534000000000001 | 0.001 | 0 | 0 |
| 0.535000000000001 | 0.001 | 0 | 0 |
| 0.536000000000001 | 0.001 | 0 | 0 |
| 0.537000000000001 | 0.001 | 0 | 0 |
| 0.538000000000001 | 0.001 | 0 | 0 |
| 0.539000000000001 | 0.001 | 0 | 0 |
| 0.540000000000001 | 0.001 | 0 | 0 |
| 0.541000000000001 | 0.001 | 0 | 0 |
| 0.542000000000001 | 0.001 | 0 | 0 |
| 0.543000000000001 | 0.001 | 0 | 0 |
| 0.544000000000001 | 0.001 | 0 | 0 |
| 0.545000000000001 | 0.001 | 0 | 0 |
| 0.546000000000001 | 0.001 | 0 | 0 |
| 0.547000000000001 | 0.001 | 0 | 0 |
| 0.548000000000001 | 0.001 | 0 | 0 |
| 0.549000000000001 | 0.001 | 0 | 0 |
| 0.550000000000001 | 0.001 | 0 | 0 |
| 0.551000000000001 | 0.001 | 0 | 0 |
| 0.552000000000001 | 0.001 | 0 | 0 |
| 0.553000000000001 | 0.001 | 0 | 0 |
| 0.554000000000001 | 0.001 | 0 | 0 |
| 0.555000000000001 | 0.001 | 0 | 0 |
| 0.556000000000001 | 0.001 | 0 | 0 |
| 0.557000000000001 | 0.001 | 0 | 0 |
| 0.558000000000001 | 0.001 | 0 | 0 |
| 0.559000000000001 | 0.001 | 0 | 0 |
| 0.560000000000001 | 0.001 | 0 | 0 |
| 0.561000000000001 | 0.001 | 0 | 0 |
| 0.562000000000001 | 0.001 | 0 | 0 |
| 0.563000000000001 | 0.001 | 0 | 0 |
| 0.564000000000001 | 0.001 | 0 | 0 |
| 0.565000000000001 | 0.001 | 0 | 0 |
| 0.566000000000001 | 0.001 | 0 | 0 |
| 0.567000000000001 | 0.001 | 0 | 0 |
| 0.568000000000001 | 0.001 | 0 | 0 |
| 0.569000000000001 | 0.001 | 0 | 0 |
| 0.570000000000001 | 0.001 | 0 | 0 |
| 0.571000000000001 | 0.001 | 0 | 0 |
| 0.572000000000001 | 0.001 | 0 | 0 |
| 0.573000000000001 | 0.001 | 0 | 0 |
| 0.574000000000001 | 0.001 | 0 | 0 |
| 0.575000000000001 | 0.001 | 0 | 0 |
| 0.576000000000001 | 0.001 | 0 | 0 |
| 0.577000000000001 | 0.001 | 0 | 0 |
| 0.578000000000001 | 0.001 | 0 | 0 |
| 0.579000000000001 | 0.001 | 0 | 0 |
| 0.580000000000001 | 0.001 | 0 | 0 |
| 0.581000000000001 | 0.001 | 0 | 0 |
| 0.582000000000001 | 0.001 | 0 | 0 |
| 0.583000000000001 | 0.001 | 0 | 0 |
| 0.584000000000001 | 0.001 | 0 | 0 |
| 0.585000000000001 | 0.001 | 0 | 0 |
| 0.586000000000001 | 0.001 | 0 | 0 |
| 0.587000000000001 | 0.001 | 0 | 0 |
| 0.588000000000001 | 0.001 | 0 | 0 |
| 0.589000000000001 | 0.001 | 0 | 0 |
| 0.590000000000001 | 0.001 | 0 | 0 |
| 0.591000000000001 | 0.001 | 0 | 0 |
| 0.592000000000001 | 0.001 | 0 | 0 |
| 0.593000000000001 | 0.001 | 0 | 0 |
| 0.594000000000001 | 0.001 | 0 | 0 |
| 0.595000000000001 | 0.001 | 0 | 0 |
| 0.596000000000001 | 0.001 | 0 | 0 |
| 0.597000000000001 | 0.001 | 0 | 0 |
| 0.598000000000001 | 0.001 | 0 | 0 |
| 0.599000000000001 | 0.001 | 0 | 0 |
| 0.600000000000001 | 0.001 | 0 | 0 |
| 0.601000000000001 | 0.001 | 0 | 0 |
| 0.602000000000001 | 0.001 | 0 | 0 |
| 0.603000000000001 | 0.001 | 0 | 0 |
| 0.604000000000001 | 0.001 | 0 | 0 |
| 0.605000000000001 | 0.001 | 0 | 0 |
| 0.606000000000001 | 0.001 | 0 | 0 |
| 0.607000000000001 | 0.001 | 0 | 0 |
| 0.608000000000001 | 0.001 | 0 | 0 |
| 0.609000000000001 | 0.001 | 0 | 0 |
| 0.610000000000001 | 0.001 | 0 | 0 |
| 0.611000000000001 | 0.001 | 0 | 0 |
| 0.612000000000001 | 0.001 | 0 | 0 |
| 0.613000000000001 | 0.001 | 0 | 0 |
| 0.614000000000001 | 0.001 | 0 | 0 |
| 0.615000000000001 | 0.001 | 0 | 0 |
| 0.616000000000001 | 0.001 | 0 | 0 |
| 0.617000000000001 | 0.001 | 0 | 0 |
| 0.618000000000001 | 0.001 | 0 | 0 |
| 0.619000000000001 | 0.001 | 0 | 0 |
| 0.620000000000001 | 0.001 | 0 | 0 |
| 0.621000000000001 | 0.001 | 0 | 0 |
| 0.622000000000001 | 0.001 | 0 | 0 |
| 0.623000000000001 | 0.001 | 0 | 0 |
| 0.624000000000001 | 0.001 | 0 | 0 |
| 0.625000000000001 | 0.001 | 0 | 0 |
| 0.626000000000001 | 0.001 | 0 | 0 |
| 0.627000000000001 | 0.001 | 0 | 0 |
| 0.628000000000001 | 0.001 | 0 | 0 |
| 0.629000000000001 | 0.001 | 0 | 0 |
| 0.630000000000001 | 0.001 | 0 | 0 |
| 0.631000000000001 | 0.001 | 0 | 0 |
| 0.632000000000001 | 0.001 | 0 | 0 |
| 0.633000000000001 | 0.001 | 0 | 0 |
| 0.634000000000001 | 0.001 | 0 | 0 |
| 0.635000000000001 | 0.001 | 0 | 0 |
| 0.636000000000001 | 0.001 | 0 | 0 |
| 0.637000000000001 | 0.001 | 0 | 0 |
| 0.638000000000001 | 0.001 | 0 | 0 |
| 0.639000000000001 | 0.001 | 0 | 0 |
| 0.640000000000001 | 0.001 | 0 | 0 |
| 0.641000000000001 | 0.001 | 0 | 0 |
| 0.642000000000001 | 0.001 | 0 | 0 |
| 0.643000000000001 | 0.001 | 0 | 0 |
| 0.644000000000001 | 0.001 | 0 | 0 |
| 0.645000000000001 | 0.001 | 0 | 0 |
| 0.646000000000001 | 0.001 | 0 | 0 |
| 0.647000000000001 | 0.001 | 0 | 0 |
| 0.648000000000001 | 0.001 | 0 | 0 |
| 0.649000000000001 | 0.001 | 0 | 0 |
| 0.650000000000001 | 0.001 | 0 | 0 |
| 0.651000000000001 | 0.001 | 0 | 0 |
| 0.652000000000001 | 0.001 | 0 | 0 |
| 0.653000000000001 | 0.001 | 0 | 0 |
| 0.654000000000001 | 0.001 | 0 | 0 |
| 0.655000000000001 | 0.001 | 0 | 0 |
| 0.656000000000001 | 0.001 | 0 | 0 |
| 0.657000000000001 | 0.001 | 0 | 0 |
| 0.658000000000001 | 0.001 | 0 | 0 |
| 0.659000000000001 | 0.001 | 0 | 0 |
| 0.660000000000001 | 0.001 | 0 | 0 |
| 0.661000000000001 | 0.001 | 0 | 0 |
| 0.662000000000001 | 0.001 | 0 | 0 |
| 0.663000000000001 | 0.001 | 0 | 0 |
| 0.664000000000001 | 0.001 | 0 | 0 |
| 0.665000000000001 | 0.001 | 0 | 0 |
| 0.666000000000001 | 0.001 | 0 | 0 |
| 0.667000000000001 | 0.001 | 0 | 0 |
| 0.668000000000001 | 0.001 | 0 | 0 |
| 0.669000000000001 | 0.001 | 0 | 0 |
| 0.670000000000001 | 0.001 | 0.001 | 0 |
| 0.671000000000001 | 0.001 | 0.001 | 0 |
| 0.672000000000001 | 0.001 | 0.001 | 0 |
| 0.673000000000001 | 0.001 | 0.001 | 0 |
| 0.674000000000001 | 0.001 | 0.001 | 0 |
| 0.675000000000001 | 0.001 | 0.001 | 0 |
| 0.676000000000001 | 0.001 | 0.001 | 0 |
| 0.677000000000001 | 0.001 | 0.001 | 0 |
| 0.678000000000001 | 0.001 | 0.001 | 0 |
| 0.679000000000001 | 0.001 | 0.001 | 0 |
| 0.680000000000001 | 0.001 | 0.001 | 0 |
| 0.681000000000001 | 0.001 | 0.001 | 0 |
| 0.682000000000001 | 0.001 | 0.001 | 0 |
| 0.683000000000001 | 0.001 | 0.001 | 0 |
| 0.684000000000001 | 0.001 | 0.001 | 0 |
| 0.685000000000001 | 0.001 | 0.001 | 0 |
| 0.686000000000001 | 0.001 | 0.001 | 0 |
| 0.687000000000001 | 0.001 | 0.001 | 0 |
| 0.688000000000001 | 0.001 | 0.001 | 0 |
| 0.689000000000001 | 0.001 | 0.001 | 0 |
| 0.690000000000001 | 0.001 | 0.001 | 0 |
| 0.691000000000001 | 0.001 | 0.001 | 0 |
| 0.692000000000001 | 0.001 | 0.001 | 0 |
| 0.693000000000001 | 0.001 | 0.001 | 0 |
| 0.694000000000001 | 0.001 | 0.001 | 0 |
| 0.695000000000001 | 0.001 | 0.001 | 0 |
| 0.696000000000001 | 0.001 | 0.001 | 0 |
| 0.697000000000001 | 0.001 | 0.001 | 0 |
| 0.698000000000001 | 0.001 | 0.001 | 0 |
| 0.699000000000001 | 0.001 | 0.001 | 0 |
| 0.700000000000001 | 0.001 | 0.001 | 0 |
| 0.701000000000001 | 0.001 | 0.001 | 0 |
| 0.702000000000001 | 0.001 | 0.001 | 0 |
| 0.703000000000001 | 0.001 | 0.001 | 0 |
| 0.704000000000001 | 0.001 | 0.001 | 0 |
| 0.705000000000001 | 0.001 | 0.001 | 0 |
| 0.706000000000001 | 0.001 | 0.001 | 0 |
| 0.707000000000001 | 0.001 | 0.001 | 0 |
| 0.708000000000001 | 0.001 | 0.001 | 0 |
| 0.709000000000001 | 0.001 | 0.001 | 0 |
| 0.710000000000001 | 0.001 | 0.001 | 0 |
| 0.711000000000001 | 0.001 | 0.001 | 0 |
| 0.712000000000001 | 0.001 | 0.001 | 0 |
| 0.713000000000001 | 0.001 | 0.001 | 0 |
| 0.714000000000001 | 0.001 | 0.001 | 0 |
| 0.715000000000001 | 0.001 | 0.001 | 0 |
| 0.716000000000001 | 0.001 | 0.001 | 0 |
| 0.717000000000001 | 0.001 | 0.001 | 0 |
| 0.718000000000001 | 0.001 | 0.001 | 0 |
| 0.719000000000001 | 0.001 | 0.001 | 0 |
| 0.720000000000001 | 0.001 | 0.001 | 0 |
| 0.721000000000001 | 0.001 | 0.001 | 0 |
| 0.722000000000001 | 0.001 | 0.001 | 0 |
| 0.723000000000001 | 0.001 | 0.001 | 0 |
| 0.724000000000001 | 0.001 | 0.001 | 0 |
| 0.725000000000001 | 0.001 | 0.001 | 0 |
| 0.726000000000001 | 0.001 | 0.001 | 0 |
| 0.727000000000001 | 0.001 | 0.001 | 0 |
| 0.728000000000001 | 0.001 | 0.001 | 0 |
| 0.729000000000001 | 0.001 | 0.001 | 0 |
| 0.730000000000001 | 0.001 | 0.001 | 0 |
| 0.731000000000001 | 0.001 | 0.001 | 0 |
| 0.732000000000001 | 0.001 | 0.001 | 0 |
| 0.733000000000001 | 0.001 | 0.001 | 0 |
| 0.734000000000001 | 0.001 | 0.001 | 0 |
| 0.735000000000001 | 0.001 | 0.001 | 0 |
| 0.736000000000001 | 0.001 | 0.001 | 0 |
| 0.737000000000001 | 0.001 | 0.001 | 0 |
| 0.738000000000001 | 0.001 | 0.001 | 0 |
| 0.739000000000001 | 0.001 | 0.001 | 0 |
| 0.740000000000001 | 0.001 | 0.001 | 0 |
| 0.741000000000001 | 0.001 | 0.001 | 0 |
| 0.742000000000001 | 0.001 | 0.001 | 0 |
| 0.743000000000001 | 0.001 | 0.001 | 0 |
| 0.744000000000001 | 0.001 | 0.001 | 0 |
| 0.745000000000001 | 0.001 | 0.001 | 0 |
| 0.746000000000001 | 0.001 | 0.001 | 0 |
| 0.747000000000001 | 0.001 | 0.001 | 0 |
| 0.748000000000001 | 0.001 | 0.001 | 0 |
| 0.749000000000001 | 0.001 | 0.001 | 0 |
| 0.750000000000001 | 0.001 | 0.001 | 0 |
| 0.751000000000001 | 0.001 | 0.001 | 0 |
| 0.752000000000001 | 0.001 | 0.001 | 0 |
| 0.753000000000001 | 0.001 | 0.001 | 0 |
| 0.754000000000001 | 0.001 | 0.001 | 0 |
| 0.755000000000001 | 0.001 | 0.001 | 0 |
| 0.756000000000001 | 0.001 | 0.001 | 0 |
| 0.757000000000001 | 0.001 | 0.001 | 0 |
| 0.758000000000001 | 0.001 | 0.001 | 0 |
| 0.759000000000001 | 0.001 | 0.001 | 0 |
| 0.760000000000001 | 0.001 | 0.001 | 0 |
| 0.761000000000001 | 0.001 | 0.001 | 0 |
| 0.762000000000001 | 0.001 | 0.001 | 0 |
| 0.763000000000001 | 0.001 | 0.001 | 0 |
| 0.764000000000001 | 0.001 | 0.001 | 0 |
| 0.765000000000001 | 0.001 | 0.001 | 0 |
| 0.766000000000001 | 0.001 | 0.001 | 0 |
| 0.767000000000001 | 0.001 | 0.001 | 0 |
| 0.768000000000001 | 0.001 | 0.001 | 0 |
| 0.769000000000001 | 0.001 | 0.001 | 0 |
| 0.770000000000001 | 0.001 | 0.001 | 0 |
| 0.771000000000001 | 0.001 | 0.001 | 0 |
| 0.772000000000001 | 0.001 | 0.001 | 0 |
| 0.773000000000001 | 0.001 | 0.001 | 0 |
| 0.774000000000001 | 0.001 | 0.001 | 0 |
| 0.775000000000001 | 0.001 | 0.001 | 0 |
| 0.776000000000001 | 0.001 | 0.001 | 0 |
| 0.777000000000001 | 0.001 | 0.001 | 0 |
| 0.778000000000001 | 0.001 | 0.001 | 0 |
| 0.779000000000001 | 0.001 | 0.001 | 0 |
| 0.780000000000001 | 0.001 | 0.001 | 0 |
| 0.781000000000001 | 0.001 | 0.001 | 0 |
| 0.782000000000001 | 0.001 | 0.001 | 0 |
| 0.783000000000001 | 0.001 | 0.001 | 0 |
| 0.784000000000001 | 0.001 | 0.001 | 0 |
| 0.785000000000001 | 0.001 | 0.001 | 0 |
| 0.786000000000001 | 0.001 | 0.001 | 0 |
| 0.787000000000001 | 0.001 | 0.001 | 0 |
| 0.788000000000001 | 0.001 | 0.001 | 0 |
| 0.789000000000001 | 0.001 | 0.001 | 0 |
| 0.790000000000001 | 0.001 | 0.001 | 0 |
| 0.791000000000001 | 0.001 | 0.001 | 0 |
| 0.792000000000001 | 0.001 | 0.001 | 0 |
| 0.793000000000001 | 0.001 | 0.001 | 0 |
| 0.794000000000001 | 0.001 | 0.001 | 0 |
| 0.795000000000001 | 0.001 | 0.001 | 0 |
| 0.796000000000001 | 0.001 | 0.001 | 0 |
| 0.797000000000001 | 0.001 | 0.001 | 0 |
| 0.798000000000001 | 0.001 | 0.001 | 0 |
| 0.799000000000001 | 0.001 | 0.001 | 0 |
| 0.800000000000001 | 0.001 | 0.001 | 0 |
| 0.801000000000001 | 0.001 | 0.001 | 0 |
| 0.802000000000001 | 0.001 | 0.001 | 0 |
| 0.803000000000001 | 0.001 | 0.001 | 0 |
| 0.804000000000001 | 0.001 | 0.001 | 0 |
| 0.805000000000001 | 0.001 | 0.001 | 0 |
| 0.806000000000001 | 0.001 | 0.001 | 0 |
| 0.807000000000001 | 0.001 | 0.001 | 0 |
| 0.808000000000001 | 0.001 | 0.001 | 0 |
| 0.809000000000001 | 0.001 | 0.001 | 0 |
| 0.810000000000001 | 0.001 | 0.001 | 0 |
| 0.811000000000001 | 0.001 | 0.001 | 0 |
| 0.812000000000001 | 0.001 | 0.001 | 0 |
| 0.813000000000001 | 0.001 | 0.001 | 0 |
| 0.814000000000001 | 0.001 | 0.001 | 0 |
| 0.815000000000001 | 0.001 | 0.001 | 0 |
| 0.816000000000001 | 0.001 | 0.001 | 0 |
| 0.817000000000001 | 0.001 | 0.001 | 0 |
| 0.818000000000001 | 0.001 | 0.001 | 0 |
| 0.819000000000001 | 0.001 | 0.001 | 0 |
| 0.820000000000001 | 0.001 | 0.001 | 0 |
| 0.821000000000001 | 0.001 | 0.001 | 0 |
| 0.822000000000001 | 0.001 | 0.001 | 0 |
| 0.823000000000001 | 0.001 | 0.001 | 0 |
| 0.824000000000001 | 0.001 | 0.001 | 0 |
| 0.825000000000001 | 0.001 | 0.001 | 0 |
| 0.826000000000001 | 0.001 | 0.001 | 0 |
| 0.827000000000001 | 0.001 | 0.001 | 0 |
| 0.828000000000001 | 0.001 | 0.001 | 0 |
| 0.829000000000001 | 0.001 | 0.001 | 0 |
| 0.830000000000001 | 0.001 | 0.001 | 0 |
| 0.831000000000001 | 0.001 | 0.001 | 0 |
| 0.832000000000001 | 0.001 | 0.001 | 0 |
| 0.833000000000001 | 0.001 | 0.001 | 0 |
| 0.834000000000001 | 0.001 | 0.001 | 0 |
| 0.835000000000001 | 0.001 | 0.001 | 0 |
| 0.836000000000001 | 0.001 | 0.001 | 0 |
| 0.837000000000001 | 0.001 | 0.001 | 0 |
| 0.838000000000001 | 0.001 | 0.001 | 0 |
| 0.839000000000001 | 0.001 | 0.001 | 0 |
| 0.840000000000001 | 0.001 | 0.001 | 0 |
| 0.841000000000001 | 0.001 | 0.001 | 0 |
| 0.842000000000001 | 0.001 | 0.001 | 0 |
| 0.843000000000001 | 0.001 | 0.001 | 0 |
| 0.844000000000001 | 0.001 | 0.001 | 0 |
| 0.845000000000001 | 0.001 | 0.001 | 0 |
| 0.846000000000001 | 0.001 | 0.001 | 0 |
| 0.847000000000001 | 0.001 | 0.001 | 0 |
| 0.848000000000001 | 0.001 | 0.001 | 0 |
| 0.849000000000001 | 0.001 | 0.001 | 0 |
| 0.850000000000001 | 0.001 | 0.001 | 0 |
| 0.851000000000001 | 0.001 | 0.001 | 0 |
| 0.852000000000001 | 0.001 | 0.001 | 0 |
| 0.853000000000001 | 0.001 | 0.001 | 0 |
| 0.854000000000001 | 0.001 | 0.001 | 0 |
| 0.855000000000001 | 0.001 | 0.001 | 0 |
| 0.856000000000001 | 0.001 | 0.001 | 0 |
| 0.857000000000001 | 0.001 | 0.001 | 0 |
| 0.858000000000001 | 0.001 | 0.001 | 0 |
| 0.859000000000001 | 0.001 | 0.001 | 0 |
| 0.860000000000001 | 0.001 | 0.001 | 0 |
| 0.861000000000001 | 0.001 | 0.001 | 0 |
| 0.862000000000001 | 0.001 | 0.001 | 0 |
| 0.863000000000001 | 0.001 | 0.001 | 0 |
| 0.864000000000001 | 0.001 | 0.001 | 0 |
| 0.865000000000001 | 0.001 | 0.001 | 0 |
| 0.866000000000001 | 0.001 | 0.001 | 0 |
| 0.867000000000001 | 0.001 | 0.001 | 0 |
| 0.868000000000001 | 0.001 | 0.001 | 0 |
| 0.869000000000001 | 0.001 | 0.001 | 0 |
| 0.870000000000001 | 0.001 | 0.001 | 0 |
| 0.871000000000001 | 0.001 | 0.001 | 0.001 |
| 0.872000000000002 | 0.001 | 0.001 | 0.001 |
| 0.873000000000002 | 0.001 | 0.001 | 0.001 |
| 0.874000000000002 | 0.001 | 0.001 | 0.001 |
| 0.875000000000002 | 0.001 | 0.001 | 0.001 |
| 0.876000000000002 | 0.001 | 0.001 | 0.001 |
| 0.877000000000002 | 0.001 | 0.001 | 0.001 |
| 0.878000000000002 | 0.001 | 0.001 | 0.001 |
| 0.879000000000002 | 0.001 | 0.001 | 0.001 |
| 0.880000000000001 | 0.001 | 0.001 | 0.001 |
| 0.881000000000001 | 0.001 | 0.001 | 0.001 |
| 0.882000000000002 | 0.001 | 0.001 | 0.001 |
| 0.883000000000002 | 0.001 | 0.001 | 0.001 |
| 0.884000000000002 | 0.001 | 0.001 | 0.001 |
| 0.885000000000002 | 0.001 | 0.001 | 0.001 |
| 0.886000000000002 | 0.001 | 0.001 | 0.001 |
| 0.887000000000002 | 0.001 | 0.001 | 0.001 |
| 0.888000000000002 | 0.001 | 0.001 | 0.001 |
| 0.889000000000002 | 0.001 | 0.001 | 0.001 |
| 0.890000000000001 | 0.001 | 0.001 | 0.001 |
| 0.891000000000001 | 0.001 | 0.001 | 0.001 |
| 0.892000000000002 | 0.001 | 0.001 | 0.001 |
| 0.893000000000002 | 0.001 | 0.001 | 0.001 |
| 0.894000000000002 | 0.001 | 0.001 | 0.001 |
| 0.895000000000002 | 0.001 | 0.001 | 0.001 |
| 0.896000000000002 | 0.001 | 0.001 | 0.001 |
| 0.897000000000002 | 0.001 | 0.001 | 0.001 |
| 0.898000000000002 | 0.001 | 0.001 | 0.001 |
| 0.899000000000002 | 0.001 | 0.001 | 0.001 |
| 0.900000000000002 | 0.001 | 0.001 | 0.001 |
| 0.901000000000002 | 0.001 | 0.001 | 0.001 |
| 0.902000000000002 | 0.001 | 0.001 | 0.001 |
| 0.903000000000002 | 0.001 | 0.001 | 0.001 |
| 0.904000000000002 | 0.001 | 0.001 | 0.001 |
| 0.905000000000002 | 0.001 | 0.001 | 0.001 |
| 0.906000000000002 | 0.001 | 0.001 | 0.001 |
| 0.907000000000002 | 0.001 | 0.001 | 0.001 |
| 0.908000000000002 | 0.001 | 0.001 | 0.001 |
| 0.909000000000002 | 0.001 | 0.001 | 0.001 |
| 0.910000000000002 | 0.001 | 0.001 | 0.001 |
| 0.911000000000002 | 0.001 | 0.001 | 0.001 |
| 0.912000000000002 | 0.001 | 0.001 | 0.001 |
| 0.913000000000002 | 0.001 | 0.001 | 0.001 |
| 0.914000000000002 | 0.001 | 0.001 | 0.001 |
| 0.915000000000002 | 0.001 | 0.001 | 0.001 |
| 0.916000000000002 | 0.001 | 0.001 | 0.001 |
| 0.917000000000002 | 0.001 | 0.001 | 0.001 |
| 0.918000000000002 | 0.001 | 0.001 | 0.001 |
| 0.919000000000002 | 0.001 | 0.001 | 0.001 |
| 0.920000000000002 | 0.001 | 0.001 | 0.001 |
| 0.921000000000002 | 0.001 | 0.001 | 0.001 |
| 0.922000000000002 | 0.001 | 0.001 | 0.001 |
| 0.923000000000002 | 0.001 | 0.001 | 0.001 |
| 0.924000000000002 | 0.001 | 0.001 | 0.001 |
| 0.925000000000002 | 0.001 | 0.001 | 0.001 |
| 0.926000000000002 | 0.001 | 0.001 | 0.001 |
| 0.927000000000002 | 0.001 | 0.001 | 0.001 |
| 0.928000000000002 | 0.001 | 0.001 | 0.001 |
| 0.929000000000002 | 0.001 | 0.001 | 0.001 |
| 0.930000000000002 | 0.001 | 0.001 | 0.001 |
| 0.931000000000002 | 0.001 | 0.001 | 0.001 |
| 0.932000000000002 | 0.001 | 0.001 | 0.001 |
| 0.933000000000002 | 0.001 | 0.001 | 0.001 |
| 0.934000000000002 | 0.001 | 0.001 | 0.001 |
| 0.935000000000002 | 0.001 | 0.001 | 0.001 |
| 0.936000000000002 | 0.001 | 0.001 | 0.001 |
| 0.937000000000002 | 0.001 | 0.001 | 0.001 |
| 0.938000000000002 | 0.001 | 0.001 | 0.001 |
| 0.939000000000002 | 0.001 | 0.001 | 0.001 |
| 0.940000000000002 | 0.001 | 0.001 | 0.001 |
| 0.941000000000002 | 0.001 | 0.001 | 0.001 |
| 0.942000000000002 | 0.001 | 0.001 | 0.001 |
| 0.943000000000002 | 0.001 | 0.001 | 0.001 |
| 0.944000000000002 | 0.001 | 0.001 | 0.001 |
| 0.945000000000002 | 0.001 | 0.001 | 0.001 |
| 0.946000000000002 | 0.001 | 0.001 | 0.001 |
| 0.947000000000002 | 0.001 | 0.001 | 0.001 |
| 0.948000000000002 | 0.001 | 0.001 | 0.001 |
| 0.949000000000002 | 0.001 | 0.001 | 0.001 |
| 0.950000000000002 | 0.001 | 0.001 | 0.001 |
| 0.951000000000002 | 0.001 | 0.001 | 0.001 |
| 0.952000000000002 | 0.001 | 0.001 | 0.001 |
| 0.953000000000002 | 0.001 | 0.001 | 0.001 |
| 0.954000000000002 | 0.001 | 0.001 | 0.001 |
| 0.955000000000002 | 0.001 | 0.001 | 0.001 |
| 0.956000000000002 | 0.001 | 0.001 | 0.001 |
| 0.957000000000002 | 0.001 | 0.001 | 0.001 |
| 0.958000000000002 | 0.001 | 0.001 | 0.001 |
| 0.959000000000002 | 0.001 | 0.001 | 0.001 |
| 0.960000000000002 | 0.001 | 0.001 | 0.001 |
| 0.961000000000002 | 0.001 | 0.001 | 0.001 |
| 0.962000000000002 | 0.001 | 0.001 | 0.001 |
| 0.963000000000002 | 0.001 | 0.001 | 0.001 |
| 0.964000000000002 | 0.001 | 0.001 | 0.001 |
| 0.965000000000002 | 0.001 | 0.001 | 0.001 |
| 0.966000000000002 | 0.001 | 0.001 | 0.001 |
| 0.967000000000002 | 0.001 | 0.001 | 0.001 |
| 0.968000000000002 | 0.001 | 0.001 | 0.001 |
| 0.969000000000002 | 0.001 | 0.001 | 0.001 |
| 0.970000000000002 | 0.001 | 0.001 | 0.001 |
| 0.971000000000002 | 0.001 | 0.001 | 0.001 |
| 0.972000000000002 | 0.001 | 0.001 | 0.001 |
| 0.973000000000002 | 0.001 | 0.001 | 0.001 |
| 0.974000000000002 | 0.001 | 0.001 | 0.001 |
| 0.975000000000002 | 0.001 | 0.001 | 0.001 |
| 0.976000000000002 | 0.001 | 0.001 | 0.001 |
| 0.977000000000002 | 0.001 | 0.001 | 0.001 |
| 0.978000000000002 | 0.001 | 0.001 | 0.001 |
| 0.979000000000002 | 0.001 | 0.001 | 0.001 |
| 0.980000000000002 | 0.001 | 0.001 | 0.001 |
| 0.981000000000002 | 0.001 | 0.001 | 0.001 |
| 0.982000000000002 | 0.001 | 0.001 | 0.001 |
| 0.983000000000002 | 0.001 | 0.001 | 0.001 |
| 0.984000000000002 | 0.001 | 0.001 | 0.001 |
| 0.985000000000002 | 0.001 | 0.001 | 0.001 |
| 0.986000000000002 | 0.001 | 0.001 | 0.001 |
| 0.987000000000002 | 0.001 | 0.001 | 0.001 |
| 0.988000000000002 | 0.001 | 0.001 | 0.001 |
| 0.989000000000002 | 0.001 | 0.001 | 0.001 |
| 0.990000000000002 | 0.001 | 0.001 | 0.001 |
| 0.991000000000002 | 0.001 | 0.001 | 0.001 |
| 0.992000000000002 | 0.001 | 0.001 | 0.001 |
| 0.993000000000002 | 0.001 | 0.001 | 0.001 |
| 0.994000000000002 | 0.001 | 0.001 | 0.001 |
| 0.995000000000002 | 0.001 | 0.001 | 0.001 |
| 0.996000000000002 | 0.001 | 0.001 | 0.001 |
| 0.997000000000002 | 0.001 | 0.001 | 0.001 |
| 0.998000000000002 | 0.001 | 0.001 | 0.001 |
| 0.999000000000002 | 0.001 | 0.001 | 0.001 |
| 1.000000000000002 | 0.001 | 0.001 | 0.001 |